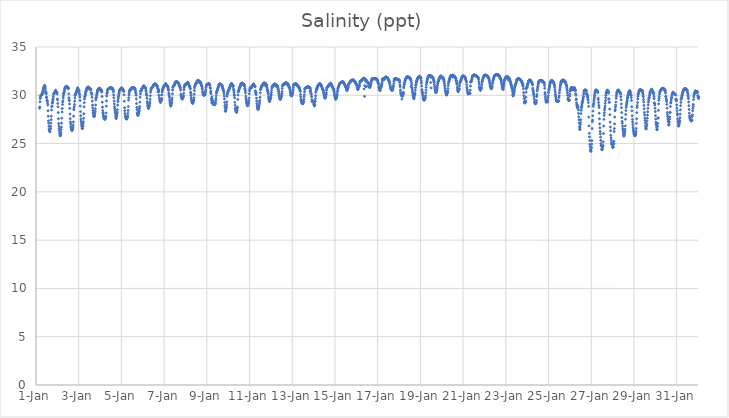
| Category | Salinity (ppt) |
|---|---|
| 44927.166666666664 | 28.66 |
| 44927.177083333336 | 28.79 |
| 44927.1875 | 29.33 |
| 44927.197916666664 | 29.66 |
| 44927.208333333336 | 29.82 |
| 44927.21875 | 29.91 |
| 44927.229166666664 | 30 |
| 44927.239583333336 | 30.04 |
| 44927.25 | 30.04 |
| 44927.260416666664 | 30.03 |
| 44927.270833333336 | 30.05 |
| 44927.28125 | 30.08 |
| 44927.291666666664 | 30.15 |
| 44927.302083333336 | 30.22 |
| 44927.3125 | 30.32 |
| 44927.322916666664 | 30.42 |
| 44927.333333333336 | 30.52 |
| 44927.34375 | 30.65 |
| 44927.354166666664 | 30.73 |
| 44927.364583333336 | 30.8 |
| 44927.375 | 30.87 |
| 44927.385416666664 | 30.89 |
| 44927.395833333336 | 30.99 |
| 44927.40625 | 31.03 |
| 44927.416666666664 | 30.91 |
| 44927.427083333336 | 30.85 |
| 44927.4375 | 30.65 |
| 44927.447916666664 | 30.25 |
| 44927.458333333336 | 30.4 |
| 44927.46875 | 30.28 |
| 44927.479166666664 | 30.15 |
| 44927.489583333336 | 29.82 |
| 44927.5 | 29.74 |
| 44927.510416666664 | 29.44 |
| 44927.520833333336 | 29.48 |
| 44927.53125 | 29.41 |
| 44927.541666666664 | 29.2 |
| 44927.552083333336 | 28.99 |
| 44927.5625 | 28.4 |
| 44927.572916666664 | 27.83 |
| 44927.583333333336 | 27.35 |
| 44927.59375 | 27.11 |
| 44927.604166666664 | 26.8 |
| 44927.614583333336 | 26.53 |
| 44927.625 | 26.37 |
| 44927.635416666664 | 26.31 |
| 44927.645833333336 | 26.23 |
| 44927.65625 | 26.25 |
| 44927.666666666664 | 26.49 |
| 44927.677083333336 | 26.56 |
| 44927.6875 | 26.77 |
| 44927.697916666664 | 27.11 |
| 44927.708333333336 | 27.47 |
| 44927.71875 | 27.84 |
| 44927.729166666664 | 28.48 |
| 44927.739583333336 | 28.84 |
| 44927.75 | 28.88 |
| 44927.760416666664 | 29.19 |
| 44927.770833333336 | 29.25 |
| 44927.78125 | 29.39 |
| 44927.791666666664 | 29.55 |
| 44927.802083333336 | 29.69 |
| 44927.8125 | 29.88 |
| 44927.822916666664 | 30.12 |
| 44927.833333333336 | 30.15 |
| 44927.84375 | 30.17 |
| 44927.854166666664 | 30.19 |
| 44927.864583333336 | 30.22 |
| 44927.875 | 30.25 |
| 44927.885416666664 | 30.34 |
| 44927.895833333336 | 30.44 |
| 44927.90625 | 30.43 |
| 44927.916666666664 | 30.53 |
| 44927.927083333336 | 30.34 |
| 44927.9375 | 30.28 |
| 44927.947916666664 | 30.37 |
| 44927.958333333336 | 30.36 |
| 44927.96875 | 30.26 |
| 44927.979166666664 | 30.27 |
| 44927.989583333336 | 30.14 |
| 44928.0 | 29.61 |
| 44928.010416666664 | 29.53 |
| 44928.020833333336 | 29.16 |
| 44928.03125 | 28.8 |
| 44928.041666666664 | 28.22 |
| 44928.052083333336 | 27.57 |
| 44928.0625 | 27.08 |
| 44928.072916666664 | 26.83 |
| 44928.083333333336 | 26.58 |
| 44928.09375 | 26.38 |
| 44928.104166666664 | 26.17 |
| 44928.114583333336 | 25.99 |
| 44928.125 | 25.87 |
| 44928.135416666664 | 25.81 |
| 44928.145833333336 | 25.83 |
| 44928.15625 | 25.96 |
| 44928.166666666664 | 26.14 |
| 44928.177083333336 | 26.45 |
| 44928.1875 | 26.71 |
| 44928.197916666664 | 27.12 |
| 44928.208333333336 | 27.63 |
| 44928.21875 | 28.27 |
| 44928.229166666664 | 28.62 |
| 44928.239583333336 | 29.05 |
| 44928.25 | 29.32 |
| 44928.260416666664 | 29.42 |
| 44928.270833333336 | 29.72 |
| 44928.28125 | 29.93 |
| 44928.291666666664 | 30.12 |
| 44928.302083333336 | 30.2 |
| 44928.3125 | 30.28 |
| 44928.322916666664 | 30.41 |
| 44928.333333333336 | 30.55 |
| 44928.34375 | 30.66 |
| 44928.354166666664 | 30.73 |
| 44928.364583333336 | 30.78 |
| 44928.375 | 30.83 |
| 44928.385416666664 | 30.87 |
| 44928.395833333336 | 30.89 |
| 44928.40625 | 30.9 |
| 44928.416666666664 | 30.91 |
| 44928.427083333336 | 30.92 |
| 44928.4375 | 30.92 |
| 44928.447916666664 | 30.81 |
| 44928.458333333336 | 30.88 |
| 44928.46875 | 30.84 |
| 44928.479166666664 | 30.79 |
| 44928.489583333336 | 30.81 |
| 44928.5 | 30.79 |
| 44928.510416666664 | 30.7 |
| 44928.520833333336 | 30.69 |
| 44928.53125 | 30.15 |
| 44928.541666666664 | 29.75 |
| 44928.552083333336 | 29.52 |
| 44928.5625 | 29.44 |
| 44928.572916666664 | 29.1 |
| 44928.583333333336 | 28.65 |
| 44928.59375 | 28.06 |
| 44928.604166666664 | 27.58 |
| 44928.614583333336 | 27.24 |
| 44928.625 | 27.04 |
| 44928.635416666664 | 26.79 |
| 44928.645833333336 | 26.65 |
| 44928.65625 | 26.53 |
| 44928.666666666664 | 26.44 |
| 44928.677083333336 | 26.35 |
| 44928.6875 | 26.36 |
| 44928.697916666664 | 26.43 |
| 44928.708333333336 | 26.51 |
| 44928.71875 | 26.58 |
| 44928.729166666664 | 26.68 |
| 44928.739583333336 | 26.92 |
| 44928.75 | 27.24 |
| 44928.760416666664 | 27.83 |
| 44928.770833333336 | 28.5 |
| 44928.78125 | 28.67 |
| 44928.791666666664 | 28.84 |
| 44928.802083333336 | 29.05 |
| 44928.8125 | 29.39 |
| 44928.822916666664 | 29.71 |
| 44928.833333333336 | 29.98 |
| 44928.84375 | 30.08 |
| 44928.854166666664 | 30.14 |
| 44928.864583333336 | 30.14 |
| 44928.875 | 30.23 |
| 44928.885416666664 | 30.31 |
| 44928.895833333336 | 30.38 |
| 44928.90625 | 30.43 |
| 44928.916666666664 | 30.48 |
| 44928.927083333336 | 30.59 |
| 44928.9375 | 30.66 |
| 44928.947916666664 | 30.78 |
| 44928.958333333336 | 30.68 |
| 44928.96875 | 30.62 |
| 44928.979166666664 | 30.59 |
| 44928.989583333336 | 30.54 |
| 44929.0 | 30.49 |
| 44929.010416666664 | 30.54 |
| 44929.020833333336 | 30.43 |
| 44929.03125 | 30.2 |
| 44929.041666666664 | 30.07 |
| 44929.052083333336 | 29.82 |
| 44929.0625 | 29.47 |
| 44929.072916666664 | 28.88 |
| 44929.083333333336 | 28.31 |
| 44929.09375 | 27.89 |
| 44929.104166666664 | 27.55 |
| 44929.114583333336 | 27.33 |
| 44929.125 | 27.14 |
| 44929.135416666664 | 26.92 |
| 44929.145833333336 | 26.79 |
| 44929.15625 | 26.62 |
| 44929.166666666664 | 26.55 |
| 44929.177083333336 | 26.57 |
| 44929.1875 | 26.76 |
| 44929.197916666664 | 26.9 |
| 44929.208333333336 | 27.08 |
| 44929.21875 | 27.27 |
| 44929.229166666664 | 27.61 |
| 44929.239583333336 | 28.09 |
| 44929.25 | 28.81 |
| 44929.260416666664 | 29.23 |
| 44929.270833333336 | 29.61 |
| 44929.28125 | 29.82 |
| 44929.291666666664 | 29.86 |
| 44929.302083333336 | 30 |
| 44929.3125 | 30.11 |
| 44929.322916666664 | 30.25 |
| 44929.333333333336 | 30.35 |
| 44929.34375 | 30.42 |
| 44929.354166666664 | 30.48 |
| 44929.364583333336 | 30.59 |
| 44929.375 | 30.67 |
| 44929.385416666664 | 30.73 |
| 44929.395833333336 | 30.78 |
| 44929.40625 | 30.8 |
| 44929.416666666664 | 30.82 |
| 44929.427083333336 | 30.83 |
| 44929.4375 | 30.84 |
| 44929.447916666664 | 30.84 |
| 44929.458333333336 | 30.84 |
| 44929.46875 | 30.74 |
| 44929.479166666664 | 30.75 |
| 44929.489583333336 | 30.74 |
| 44929.5 | 30.75 |
| 44929.510416666664 | 30.64 |
| 44929.520833333336 | 30.69 |
| 44929.53125 | 30.62 |
| 44929.541666666664 | 30.61 |
| 44929.552083333336 | 30.68 |
| 44929.5625 | 30.6 |
| 44929.572916666664 | 30.58 |
| 44929.583333333336 | 30.27 |
| 44929.59375 | 30.2 |
| 44929.604166666664 | 30.19 |
| 44929.614583333336 | 30.09 |
| 44929.625 | 29.79 |
| 44929.635416666664 | 29.4 |
| 44929.645833333336 | 28.99 |
| 44929.65625 | 28.71 |
| 44929.666666666664 | 28.43 |
| 44929.677083333336 | 28.21 |
| 44929.6875 | 28.09 |
| 44929.697916666664 | 27.93 |
| 44929.708333333336 | 27.82 |
| 44929.71875 | 27.77 |
| 44929.729166666664 | 27.82 |
| 44929.739583333336 | 27.95 |
| 44929.75 | 28.07 |
| 44929.760416666664 | 28.15 |
| 44929.770833333336 | 28.32 |
| 44929.78125 | 28.6 |
| 44929.791666666664 | 28.99 |
| 44929.802083333336 | 29.52 |
| 44929.8125 | 29.68 |
| 44929.822916666664 | 29.77 |
| 44929.833333333336 | 29.92 |
| 44929.84375 | 30.07 |
| 44929.854166666664 | 30.2 |
| 44929.864583333336 | 30.31 |
| 44929.875 | 30.4 |
| 44929.885416666664 | 30.49 |
| 44929.895833333336 | 30.57 |
| 44929.90625 | 30.62 |
| 44929.916666666664 | 30.65 |
| 44929.927083333336 | 30.68 |
| 44929.9375 | 30.69 |
| 44929.947916666664 | 30.7 |
| 44929.958333333336 | 30.71 |
| 44929.96875 | 30.72 |
| 44929.979166666664 | 30.73 |
| 44929.989583333336 | 30.72 |
| 44930.0 | 30.58 |
| 44930.010416666664 | 30.54 |
| 44930.020833333336 | 30.6 |
| 44930.03125 | 30.59 |
| 44930.041666666664 | 30.48 |
| 44930.052083333336 | 30.48 |
| 44930.0625 | 30.55 |
| 44930.072916666664 | 30.39 |
| 44930.083333333336 | 30.33 |
| 44930.09375 | 29.87 |
| 44930.104166666664 | 29.29 |
| 44930.114583333336 | 28.77 |
| 44930.125 | 28.42 |
| 44930.135416666664 | 28.21 |
| 44930.145833333336 | 28.07 |
| 44930.15625 | 27.9 |
| 44930.166666666664 | 27.77 |
| 44930.177083333336 | 27.67 |
| 44930.1875 | 27.59 |
| 44930.197916666664 | 27.53 |
| 44930.208333333336 | 27.52 |
| 44930.21875 | 27.53 |
| 44930.229166666664 | 27.54 |
| 44930.239583333336 | 27.56 |
| 44930.25 | 27.59 |
| 44930.260416666664 | 27.69 |
| 44930.270833333336 | 27.83 |
| 44930.28125 | 28.17 |
| 44930.291666666664 | 28.88 |
| 44930.302083333336 | 29.42 |
| 44930.3125 | 29.92 |
| 44930.322916666664 | 30.17 |
| 44930.333333333336 | 30.3 |
| 44930.34375 | 30.45 |
| 44930.354166666664 | 30.56 |
| 44930.364583333336 | 30.61 |
| 44930.375 | 30.64 |
| 44930.385416666664 | 30.66 |
| 44930.395833333336 | 30.66 |
| 44930.40625 | 30.68 |
| 44930.416666666664 | 30.69 |
| 44930.427083333336 | 30.7 |
| 44930.4375 | 30.72 |
| 44930.447916666664 | 30.75 |
| 44930.458333333336 | 30.77 |
| 44930.46875 | 30.78 |
| 44930.479166666664 | 30.8 |
| 44930.489583333336 | 30.8 |
| 44930.5 | 30.8 |
| 44930.510416666664 | 30.8 |
| 44930.520833333336 | 30.72 |
| 44930.53125 | 30.74 |
| 44930.541666666664 | 30.68 |
| 44930.552083333336 | 30.69 |
| 44930.5625 | 30.67 |
| 44930.572916666664 | 30.71 |
| 44930.583333333336 | 30.73 |
| 44930.59375 | 30.68 |
| 44930.604166666664 | 30.61 |
| 44930.614583333336 | 30.52 |
| 44930.625 | 30.35 |
| 44930.635416666664 | 30.04 |
| 44930.645833333336 | 29.75 |
| 44930.65625 | 29.4 |
| 44930.666666666664 | 29.1 |
| 44930.677083333336 | 28.81 |
| 44930.6875 | 28.63 |
| 44930.697916666664 | 28.45 |
| 44930.708333333336 | 28.28 |
| 44930.71875 | 28.12 |
| 44930.729166666664 | 27.9 |
| 44930.739583333336 | 27.72 |
| 44930.75 | 27.61 |
| 44930.760416666664 | 27.6 |
| 44930.770833333336 | 27.81 |
| 44930.78125 | 27.96 |
| 44930.791666666664 | 28.06 |
| 44930.802083333336 | 28.25 |
| 44930.8125 | 28.5 |
| 44930.822916666664 | 28.97 |
| 44930.833333333336 | 29.33 |
| 44930.84375 | 29.51 |
| 44930.854166666664 | 29.72 |
| 44930.864583333336 | 29.87 |
| 44930.875 | 30.03 |
| 44930.885416666664 | 30.18 |
| 44930.895833333336 | 30.32 |
| 44930.90625 | 30.44 |
| 44930.916666666664 | 30.53 |
| 44930.927083333336 | 30.56 |
| 44930.9375 | 30.61 |
| 44930.947916666664 | 30.63 |
| 44930.958333333336 | 30.66 |
| 44930.96875 | 30.7 |
| 44930.979166666664 | 30.72 |
| 44930.989583333336 | 30.73 |
| 44931.0 | 30.77 |
| 44931.010416666664 | 30.75 |
| 44931.020833333336 | 30.77 |
| 44931.03125 | 30.65 |
| 44931.041666666664 | 30.68 |
| 44931.052083333336 | 30.67 |
| 44931.0625 | 30.64 |
| 44931.072916666664 | 30.54 |
| 44931.083333333336 | 30.46 |
| 44931.09375 | 30.5 |
| 44931.104166666664 | 30.48 |
| 44931.114583333336 | 30.4 |
| 44931.125 | 30.05 |
| 44931.135416666664 | 29.38 |
| 44931.145833333336 | 28.72 |
| 44931.15625 | 28.4 |
| 44931.166666666664 | 28.12 |
| 44931.177083333336 | 27.94 |
| 44931.1875 | 27.79 |
| 44931.197916666664 | 27.71 |
| 44931.208333333336 | 27.65 |
| 44931.21875 | 27.59 |
| 44931.229166666664 | 27.57 |
| 44931.239583333336 | 27.54 |
| 44931.25 | 27.55 |
| 44931.260416666664 | 27.63 |
| 44931.270833333336 | 27.67 |
| 44931.28125 | 27.71 |
| 44931.291666666664 | 27.86 |
| 44931.302083333336 | 28.12 |
| 44931.3125 | 28.43 |
| 44931.322916666664 | 28.83 |
| 44931.333333333336 | 29.5 |
| 44931.34375 | 29.75 |
| 44931.354166666664 | 30.03 |
| 44931.364583333336 | 30.24 |
| 44931.375 | 30.4 |
| 44931.385416666664 | 30.48 |
| 44931.395833333336 | 30.53 |
| 44931.40625 | 30.56 |
| 44931.416666666664 | 30.58 |
| 44931.427083333336 | 30.59 |
| 44931.4375 | 30.6 |
| 44931.447916666664 | 30.63 |
| 44931.458333333336 | 30.68 |
| 44931.46875 | 30.72 |
| 44931.479166666664 | 30.74 |
| 44931.489583333336 | 30.76 |
| 44931.5 | 30.77 |
| 44931.510416666664 | 30.78 |
| 44931.520833333336 | 30.79 |
| 44931.53125 | 30.8 |
| 44931.541666666664 | 30.8 |
| 44931.552083333336 | 30.81 |
| 44931.5625 | 30.79 |
| 44931.572916666664 | 30.79 |
| 44931.583333333336 | 30.76 |
| 44931.59375 | 30.74 |
| 44931.604166666664 | 30.75 |
| 44931.614583333336 | 30.7 |
| 44931.625 | 30.71 |
| 44931.635416666664 | 30.67 |
| 44931.645833333336 | 30.57 |
| 44931.65625 | 30.49 |
| 44931.666666666664 | 30.31 |
| 44931.677083333336 | 30.16 |
| 44931.6875 | 30 |
| 44931.697916666664 | 29.62 |
| 44931.708333333336 | 29.14 |
| 44931.71875 | 28.75 |
| 44931.729166666664 | 28.52 |
| 44931.739583333336 | 28.2 |
| 44931.75 | 28.07 |
| 44931.760416666664 | 27.96 |
| 44931.770833333336 | 27.91 |
| 44931.78125 | 27.95 |
| 44931.791666666664 | 27.96 |
| 44931.802083333336 | 28.12 |
| 44931.8125 | 28.16 |
| 44931.822916666664 | 28.32 |
| 44931.833333333336 | 28.45 |
| 44931.84375 | 28.65 |
| 44931.854166666664 | 28.84 |
| 44931.864583333336 | 29.29 |
| 44931.875 | 29.8 |
| 44931.885416666664 | 30.15 |
| 44931.895833333336 | 30.41 |
| 44931.90625 | 30.45 |
| 44931.916666666664 | 30.4 |
| 44931.927083333336 | 30.51 |
| 44931.9375 | 30.57 |
| 44931.947916666664 | 30.63 |
| 44931.958333333336 | 30.67 |
| 44931.96875 | 30.69 |
| 44931.979166666664 | 30.73 |
| 44931.989583333336 | 30.77 |
| 44932.0 | 30.81 |
| 44932.010416666664 | 30.86 |
| 44932.020833333336 | 30.89 |
| 44932.03125 | 30.92 |
| 44932.041666666664 | 30.97 |
| 44932.052083333336 | 31 |
| 44932.0625 | 30.91 |
| 44932.072916666664 | 30.89 |
| 44932.083333333336 | 30.84 |
| 44932.09375 | 30.82 |
| 44932.104166666664 | 30.78 |
| 44932.114583333336 | 30.81 |
| 44932.125 | 30.78 |
| 44932.135416666664 | 30.68 |
| 44932.145833333336 | 30.52 |
| 44932.15625 | 30.4 |
| 44932.166666666664 | 30.2 |
| 44932.177083333336 | 30.05 |
| 44932.1875 | 29.97 |
| 44932.197916666664 | 29.69 |
| 44932.208333333336 | 29.34 |
| 44932.21875 | 29.17 |
| 44932.229166666664 | 28.98 |
| 44932.239583333336 | 28.83 |
| 44932.25 | 28.74 |
| 44932.260416666664 | 28.65 |
| 44932.270833333336 | 28.64 |
| 44932.28125 | 28.67 |
| 44932.291666666664 | 28.81 |
| 44932.302083333336 | 28.85 |
| 44932.3125 | 28.91 |
| 44932.322916666664 | 29.12 |
| 44932.333333333336 | 29.29 |
| 44932.34375 | 29.57 |
| 44932.354166666664 | 29.95 |
| 44932.364583333336 | 30.31 |
| 44932.375 | 30.49 |
| 44932.385416666664 | 30.64 |
| 44932.395833333336 | 30.72 |
| 44932.40625 | 30.75 |
| 44932.416666666664 | 30.76 |
| 44932.427083333336 | 30.75 |
| 44932.4375 | 30.78 |
| 44932.447916666664 | 30.82 |
| 44932.458333333336 | 30.87 |
| 44932.46875 | 30.9 |
| 44932.479166666664 | 30.93 |
| 44932.489583333336 | 30.98 |
| 44932.5 | 31.02 |
| 44932.510416666664 | 31.06 |
| 44932.520833333336 | 31.09 |
| 44932.53125 | 31.12 |
| 44932.541666666664 | 31.14 |
| 44932.552083333336 | 31.16 |
| 44932.5625 | 31.18 |
| 44932.572916666664 | 31.18 |
| 44932.583333333336 | 31.18 |
| 44932.59375 | 31.11 |
| 44932.604166666664 | 31.15 |
| 44932.614583333336 | 31.14 |
| 44932.625 | 31.11 |
| 44932.635416666664 | 31.06 |
| 44932.645833333336 | 31.04 |
| 44932.65625 | 31.01 |
| 44932.666666666664 | 30.99 |
| 44932.677083333336 | 30.93 |
| 44932.6875 | 30.81 |
| 44932.697916666664 | 30.72 |
| 44932.708333333336 | 30.34 |
| 44932.71875 | 30.66 |
| 44932.729166666664 | 30.59 |
| 44932.739583333336 | 30.52 |
| 44932.75 | 30.36 |
| 44932.760416666664 | 30 |
| 44932.770833333336 | 29.98 |
| 44932.78125 | 29.7 |
| 44932.791666666664 | 29.54 |
| 44932.802083333336 | 29.45 |
| 44932.8125 | 29.36 |
| 44932.822916666664 | 29.29 |
| 44932.833333333336 | 29.25 |
| 44932.84375 | 29.38 |
| 44932.854166666664 | 29.45 |
| 44932.864583333336 | 29.48 |
| 44932.875 | 29.57 |
| 44932.885416666664 | 29.69 |
| 44932.895833333336 | 30.05 |
| 44932.90625 | 30.34 |
| 44932.916666666664 | 30.46 |
| 44932.927083333336 | 30.57 |
| 44932.9375 | 30.64 |
| 44932.947916666664 | 30.72 |
| 44932.958333333336 | 30.79 |
| 44932.96875 | 30.84 |
| 44932.979166666664 | 30.88 |
| 44932.989583333336 | 30.93 |
| 44933.0 | 30.97 |
| 44933.010416666664 | 31.01 |
| 44933.020833333336 | 31.03 |
| 44933.03125 | 31.05 |
| 44933.041666666664 | 31.07 |
| 44933.052083333336 | 31.1 |
| 44933.0625 | 31.13 |
| 44933.072916666664 | 31.22 |
| 44933.083333333336 | 31.08 |
| 44933.09375 | 31.1 |
| 44933.104166666664 | 31.07 |
| 44933.114583333336 | 31.05 |
| 44933.125 | 31.03 |
| 44933.135416666664 | 30.99 |
| 44933.145833333336 | 30.97 |
| 44933.15625 | 30.91 |
| 44933.166666666664 | 30.91 |
| 44933.177083333336 | 30.82 |
| 44933.1875 | 30.72 |
| 44933.197916666664 | 30.54 |
| 44933.208333333336 | 30.55 |
| 44933.21875 | 30.24 |
| 44933.229166666664 | 30.09 |
| 44933.239583333336 | 29.91 |
| 44933.25 | 29.77 |
| 44933.260416666664 | 29.52 |
| 44933.270833333336 | 29.33 |
| 44933.28125 | 29.18 |
| 44933.291666666664 | 29.02 |
| 44933.302083333336 | 28.94 |
| 44933.3125 | 28.9 |
| 44933.322916666664 | 28.88 |
| 44933.333333333336 | 29.07 |
| 44933.34375 | 29.17 |
| 44933.354166666664 | 29.28 |
| 44933.364583333336 | 29.51 |
| 44933.375 | 29.72 |
| 44933.385416666664 | 30.15 |
| 44933.395833333336 | 30.54 |
| 44933.40625 | 30.79 |
| 44933.416666666664 | 30.9 |
| 44933.427083333336 | 30.95 |
| 44933.4375 | 30.96 |
| 44933.447916666664 | 30.98 |
| 44933.458333333336 | 30.98 |
| 44933.46875 | 31 |
| 44933.479166666664 | 31.06 |
| 44933.489583333336 | 31.17 |
| 44933.5 | 31.23 |
| 44933.510416666664 | 31.28 |
| 44933.520833333336 | 31.33 |
| 44933.53125 | 31.35 |
| 44933.541666666664 | 31.36 |
| 44933.552083333336 | 31.38 |
| 44933.5625 | 31.4 |
| 44933.572916666664 | 31.4 |
| 44933.583333333336 | 31.4 |
| 44933.59375 | 31.4 |
| 44933.604166666664 | 31.38 |
| 44933.614583333336 | 31.31 |
| 44933.625 | 31.37 |
| 44933.635416666664 | 31.33 |
| 44933.645833333336 | 31.29 |
| 44933.65625 | 31.28 |
| 44933.666666666664 | 31.26 |
| 44933.677083333336 | 31.24 |
| 44933.6875 | 31.19 |
| 44933.697916666664 | 31.14 |
| 44933.708333333336 | 31.03 |
| 44933.71875 | 30.97 |
| 44933.729166666664 | 30.95 |
| 44933.739583333336 | 30.88 |
| 44933.75 | 30.8 |
| 44933.760416666664 | 30.73 |
| 44933.770833333336 | 30.53 |
| 44933.78125 | 30.11 |
| 44933.791666666664 | 30.03 |
| 44933.802083333336 | 29.87 |
| 44933.8125 | 29.78 |
| 44933.822916666664 | 29.73 |
| 44933.833333333336 | 29.65 |
| 44933.84375 | 29.61 |
| 44933.854166666664 | 29.61 |
| 44933.864583333336 | 29.7 |
| 44933.875 | 29.76 |
| 44933.885416666664 | 29.78 |
| 44933.895833333336 | 29.84 |
| 44933.90625 | 29.95 |
| 44933.916666666664 | 30.21 |
| 44933.927083333336 | 30.57 |
| 44933.9375 | 30.78 |
| 44933.947916666664 | 30.92 |
| 44933.958333333336 | 30.99 |
| 44933.96875 | 31.03 |
| 44933.979166666664 | 31.07 |
| 44933.989583333336 | 31.09 |
| 44934.0 | 31.12 |
| 44934.010416666664 | 31.14 |
| 44934.020833333336 | 31.16 |
| 44934.03125 | 31.17 |
| 44934.041666666664 | 31.19 |
| 44934.052083333336 | 31.2 |
| 44934.0625 | 31.23 |
| 44934.072916666664 | 31.25 |
| 44934.083333333336 | 31.26 |
| 44934.09375 | 31.27 |
| 44934.104166666664 | 31.35 |
| 44934.114583333336 | 31.29 |
| 44934.125 | 31.27 |
| 44934.135416666664 | 31.21 |
| 44934.145833333336 | 31.18 |
| 44934.15625 | 31.13 |
| 44934.166666666664 | 31 |
| 44934.177083333336 | 30.97 |
| 44934.1875 | 30.94 |
| 44934.197916666664 | 30.89 |
| 44934.208333333336 | 30.84 |
| 44934.21875 | 30.74 |
| 44934.229166666664 | 30.67 |
| 44934.239583333336 | 30.32 |
| 44934.25 | 30.19 |
| 44934.260416666664 | 29.97 |
| 44934.270833333336 | 29.73 |
| 44934.28125 | 29.55 |
| 44934.291666666664 | 29.41 |
| 44934.302083333336 | 29.33 |
| 44934.3125 | 29.24 |
| 44934.322916666664 | 29.18 |
| 44934.333333333336 | 29.16 |
| 44934.34375 | 29.18 |
| 44934.354166666664 | 29.26 |
| 44934.364583333336 | 29.34 |
| 44934.375 | 29.4 |
| 44934.385416666664 | 29.54 |
| 44934.395833333336 | 29.75 |
| 44934.40625 | 30.11 |
| 44934.416666666664 | 30.49 |
| 44934.427083333336 | 30.77 |
| 44934.4375 | 30.92 |
| 44934.447916666664 | 31.04 |
| 44934.458333333336 | 31.09 |
| 44934.46875 | 31.13 |
| 44934.479166666664 | 31.17 |
| 44934.489583333336 | 31.19 |
| 44934.5 | 31.2 |
| 44934.510416666664 | 31.25 |
| 44934.520833333336 | 31.36 |
| 44934.53125 | 31.42 |
| 44934.541666666664 | 31.46 |
| 44934.552083333336 | 31.5 |
| 44934.5625 | 31.51 |
| 44934.572916666664 | 31.51 |
| 44934.583333333336 | 31.52 |
| 44934.59375 | 31.53 |
| 44934.604166666664 | 31.53 |
| 44934.614583333336 | 31.53 |
| 44934.625 | 31.36 |
| 44934.635416666664 | 31.45 |
| 44934.645833333336 | 31.43 |
| 44934.65625 | 31.39 |
| 44934.666666666664 | 31.38 |
| 44934.677083333336 | 31.4 |
| 44934.6875 | 31.33 |
| 44934.697916666664 | 31.37 |
| 44934.708333333336 | 31.28 |
| 44934.71875 | 31.22 |
| 44934.729166666664 | 31.16 |
| 44934.739583333336 | 31.13 |
| 44934.75 | 31.03 |
| 44934.760416666664 | 30.96 |
| 44934.770833333336 | 30.89 |
| 44934.78125 | 30.73 |
| 44934.791666666664 | 30.61 |
| 44934.802083333336 | 30.38 |
| 44934.8125 | 30.29 |
| 44934.822916666664 | 30.18 |
| 44934.833333333336 | 30.1 |
| 44934.84375 | 30.06 |
| 44934.854166666664 | 30.03 |
| 44934.864583333336 | 30 |
| 44934.875 | 29.99 |
| 44934.885416666664 | 30.04 |
| 44934.895833333336 | 30.09 |
| 44934.90625 | 30.07 |
| 44934.916666666664 | 30.12 |
| 44934.927083333336 | 30.26 |
| 44934.9375 | 30.38 |
| 44934.947916666664 | 30.55 |
| 44934.958333333336 | 30.8 |
| 44934.96875 | 30.95 |
| 44934.979166666664 | 31.04 |
| 44934.989583333336 | 31.11 |
| 44935.0 | 31.12 |
| 44935.010416666664 | 31.12 |
| 44935.020833333336 | 31.11 |
| 44935.03125 | 31.11 |
| 44935.041666666664 | 31.15 |
| 44935.052083333336 | 31.16 |
| 44935.0625 | 31.15 |
| 44935.072916666664 | 31.17 |
| 44935.083333333336 | 31.18 |
| 44935.09375 | 31.19 |
| 44935.104166666664 | 31.22 |
| 44935.114583333336 | 31.11 |
| 44935.125 | 31.12 |
| 44935.135416666664 | 31.09 |
| 44935.145833333336 | 31.04 |
| 44935.15625 | 30.79 |
| 44935.166666666664 | 30.72 |
| 44935.177083333336 | 30.31 |
| 44935.1875 | 30.45 |
| 44935.197916666664 | 30.16 |
| 44935.208333333336 | 29.65 |
| 44935.21875 | 29.47 |
| 44935.229166666664 | 29.22 |
| 44935.239583333336 | 29.84 |
| 44935.25 | 29.62 |
| 44935.260416666664 | 29.42 |
| 44935.270833333336 | 29.45 |
| 44935.28125 | 29.3 |
| 44935.291666666664 | 29.16 |
| 44935.302083333336 | 29.06 |
| 44935.3125 | 29.04 |
| 44935.322916666664 | 29.05 |
| 44935.333333333336 | 29.06 |
| 44935.34375 | 29.06 |
| 44935.354166666664 | 29.05 |
| 44935.364583333336 | 29.01 |
| 44935.375 | 29.05 |
| 44935.385416666664 | 29.09 |
| 44935.395833333336 | 29.15 |
| 44935.40625 | 29.28 |
| 44935.416666666664 | 29.47 |
| 44935.427083333336 | 29.66 |
| 44935.4375 | 29.95 |
| 44935.447916666664 | 30.2 |
| 44935.458333333336 | 30.33 |
| 44935.46875 | 30.4 |
| 44935.479166666664 | 30.48 |
| 44935.489583333336 | 30.53 |
| 44935.5 | 30.58 |
| 44935.510416666664 | 30.66 |
| 44935.520833333336 | 30.75 |
| 44935.53125 | 30.83 |
| 44935.541666666664 | 30.9 |
| 44935.552083333336 | 30.98 |
| 44935.5625 | 31.05 |
| 44935.572916666664 | 31.11 |
| 44935.583333333336 | 31.13 |
| 44935.59375 | 31.15 |
| 44935.604166666664 | 31.16 |
| 44935.614583333336 | 31.18 |
| 44935.625 | 31.18 |
| 44935.635416666664 | 31.11 |
| 44935.645833333336 | 31.1 |
| 44935.65625 | 31.13 |
| 44935.666666666664 | 31.12 |
| 44935.677083333336 | 31.1 |
| 44935.6875 | 31.09 |
| 44935.697916666664 | 31.06 |
| 44935.708333333336 | 31.02 |
| 44935.71875 | 30.98 |
| 44935.729166666664 | 30.89 |
| 44935.739583333336 | 30.78 |
| 44935.75 | 30.71 |
| 44935.760416666664 | 30.62 |
| 44935.770833333336 | 30.52 |
| 44935.78125 | 30.48 |
| 44935.791666666664 | 30.37 |
| 44935.802083333336 | 30.17 |
| 44935.8125 | 29.91 |
| 44935.822916666664 | 29.63 |
| 44935.833333333336 | 29.26 |
| 44935.84375 | 28.94 |
| 44935.854166666664 | 28.7 |
| 44935.864583333336 | 28.43 |
| 44935.875 | 28.33 |
| 44935.885416666664 | 28.38 |
| 44935.895833333336 | 28.51 |
| 44935.90625 | 28.68 |
| 44935.916666666664 | 28.8 |
| 44935.927083333336 | 29.05 |
| 44935.9375 | 29.32 |
| 44935.947916666664 | 29.9 |
| 44935.958333333336 | 30.11 |
| 44935.96875 | 30.2 |
| 44935.979166666664 | 30.31 |
| 44935.989583333336 | 30.38 |
| 44936.0 | 30.43 |
| 44936.010416666664 | 30.48 |
| 44936.020833333336 | 30.54 |
| 44936.03125 | 30.59 |
| 44936.041666666664 | 30.62 |
| 44936.052083333336 | 30.68 |
| 44936.0625 | 30.75 |
| 44936.072916666664 | 30.83 |
| 44936.083333333336 | 30.9 |
| 44936.09375 | 30.96 |
| 44936.104166666664 | 31 |
| 44936.114583333336 | 31.06 |
| 44936.125 | 31.09 |
| 44936.135416666664 | 31.15 |
| 44936.145833333336 | 31.21 |
| 44936.15625 | 31.23 |
| 44936.166666666664 | 31.19 |
| 44936.177083333336 | 31.1 |
| 44936.1875 | 31.09 |
| 44936.197916666664 | 31 |
| 44936.208333333336 | 30.91 |
| 44936.21875 | 31.01 |
| 44936.229166666664 | 30.97 |
| 44936.239583333336 | 30.93 |
| 44936.25 | 30.64 |
| 44936.260416666664 | 30.5 |
| 44936.270833333336 | 30.3 |
| 44936.28125 | 30.08 |
| 44936.291666666664 | 29.96 |
| 44936.302083333336 | 29.73 |
| 44936.3125 | 29.27 |
| 44936.322916666664 | 28.96 |
| 44936.333333333336 | 28.65 |
| 44936.34375 | 28.51 |
| 44936.354166666664 | 28.44 |
| 44936.364583333336 | 28.35 |
| 44936.375 | 28.32 |
| 44936.385416666664 | 28.35 |
| 44936.395833333336 | 28.21 |
| 44936.40625 | 28.48 |
| 44936.416666666664 | 28.45 |
| 44936.427083333336 | 28.77 |
| 44936.4375 | 28.71 |
| 44936.447916666664 | 29.57 |
| 44936.458333333336 | 30.02 |
| 44936.46875 | 30.33 |
| 44936.479166666664 | 30.42 |
| 44936.489583333336 | 30.46 |
| 44936.5 | 30.54 |
| 44936.510416666664 | 30.63 |
| 44936.520833333336 | 30.7 |
| 44936.53125 | 30.78 |
| 44936.541666666664 | 30.84 |
| 44936.552083333336 | 30.9 |
| 44936.5625 | 30.92 |
| 44936.572916666664 | 30.97 |
| 44936.583333333336 | 31.09 |
| 44936.59375 | 31.16 |
| 44936.604166666664 | 31.19 |
| 44936.614583333336 | 31.22 |
| 44936.625 | 31.21 |
| 44936.635416666664 | 31.25 |
| 44936.645833333336 | 31.25 |
| 44936.65625 | 31.25 |
| 44936.666666666664 | 31.26 |
| 44936.677083333336 | 31.18 |
| 44936.6875 | 31.18 |
| 44936.697916666664 | 31.11 |
| 44936.708333333336 | 31.13 |
| 44936.71875 | 31.15 |
| 44936.729166666664 | 31.14 |
| 44936.739583333336 | 31.13 |
| 44936.75 | 31.1 |
| 44936.760416666664 | 31.02 |
| 44936.770833333336 | 30.92 |
| 44936.78125 | 30.72 |
| 44936.791666666664 | 30.58 |
| 44936.802083333336 | 30.46 |
| 44936.8125 | 30.26 |
| 44936.822916666664 | 29.91 |
| 44936.833333333336 | 29.7 |
| 44936.84375 | 29.54 |
| 44936.854166666664 | 29.37 |
| 44936.864583333336 | 29.21 |
| 44936.875 | 29.12 |
| 44936.885416666664 | 29.01 |
| 44936.895833333336 | 28.93 |
| 44936.90625 | 28.91 |
| 44936.916666666664 | 28.95 |
| 44936.927083333336 | 29.07 |
| 44936.9375 | 29.11 |
| 44936.947916666664 | 29.17 |
| 44936.958333333336 | 29.31 |
| 44936.96875 | 29.45 |
| 44936.979166666664 | 29.71 |
| 44936.989583333336 | 30.16 |
| 44937.0 | 30.45 |
| 44937.010416666664 | 30.64 |
| 44937.020833333336 | 30.72 |
| 44937.03125 | 30.77 |
| 44937.041666666664 | 30.81 |
| 44937.052083333336 | 30.81 |
| 44937.0625 | 30.79 |
| 44937.072916666664 | 30.79 |
| 44937.083333333336 | 30.76 |
| 44937.09375 | 30.82 |
| 44937.104166666664 | 30.89 |
| 44937.114583333336 | 30.94 |
| 44937.125 | 30.98 |
| 44937.135416666664 | 31.01 |
| 44937.145833333336 | 31.04 |
| 44937.15625 | 31.06 |
| 44937.166666666664 | 31.07 |
| 44937.177083333336 | 31.12 |
| 44937.1875 | 31.19 |
| 44937.197916666664 | 31.07 |
| 44937.208333333336 | 31.07 |
| 44937.21875 | 31 |
| 44937.229166666664 | 31 |
| 44937.239583333336 | 30.96 |
| 44937.25 | 30.93 |
| 44937.260416666664 | 30.89 |
| 44937.270833333336 | 30.46 |
| 44937.28125 | 30.36 |
| 44937.291666666664 | 30.13 |
| 44937.302083333336 | 30.28 |
| 44937.3125 | 30.09 |
| 44937.322916666664 | 29.7 |
| 44937.333333333336 | 29.41 |
| 44937.34375 | 29.13 |
| 44937.354166666664 | 28.91 |
| 44937.364583333336 | 28.77 |
| 44937.375 | 28.68 |
| 44937.385416666664 | 28.58 |
| 44937.395833333336 | 28.55 |
| 44937.40625 | 28.59 |
| 44937.416666666664 | 28.58 |
| 44937.427083333336 | 28.79 |
| 44937.4375 | 28.8 |
| 44937.447916666664 | 28.96 |
| 44937.458333333336 | 29.11 |
| 44937.46875 | 29.3 |
| 44937.479166666664 | 29.46 |
| 44937.489583333336 | 29.79 |
| 44937.5 | 30.25 |
| 44937.510416666664 | 30.58 |
| 44937.520833333336 | 30.61 |
| 44937.53125 | 30.69 |
| 44937.541666666664 | 30.79 |
| 44937.552083333336 | 30.86 |
| 44937.5625 | 30.93 |
| 44937.572916666664 | 30.96 |
| 44937.583333333336 | 30.98 |
| 44937.59375 | 30.99 |
| 44937.604166666664 | 31.04 |
| 44937.614583333336 | 31.08 |
| 44937.625 | 31.12 |
| 44937.635416666664 | 31.16 |
| 44937.645833333336 | 31.2 |
| 44937.65625 | 31.24 |
| 44937.666666666664 | 31.24 |
| 44937.677083333336 | 31.24 |
| 44937.6875 | 31.28 |
| 44937.697916666664 | 31.3 |
| 44937.708333333336 | 31.18 |
| 44937.71875 | 31.15 |
| 44937.729166666664 | 31.02 |
| 44937.739583333336 | 31.17 |
| 44937.75 | 31.23 |
| 44937.760416666664 | 31.19 |
| 44937.770833333336 | 31.06 |
| 44937.78125 | 31.12 |
| 44937.791666666664 | 31.06 |
| 44937.802083333336 | 31 |
| 44937.8125 | 30.82 |
| 44937.822916666664 | 30.75 |
| 44937.833333333336 | 30.59 |
| 44937.84375 | 30.54 |
| 44937.854166666664 | 30.41 |
| 44937.864583333336 | 30.34 |
| 44937.875 | 30.16 |
| 44937.885416666664 | 29.88 |
| 44937.895833333336 | 29.7 |
| 44937.90625 | 29.59 |
| 44937.916666666664 | 29.48 |
| 44937.927083333336 | 29.37 |
| 44937.9375 | 29.36 |
| 44937.947916666664 | 29.4 |
| 44937.958333333336 | 29.53 |
| 44937.96875 | 29.61 |
| 44937.979166666664 | 29.65 |
| 44937.989583333336 | 29.78 |
| 44938.0 | 29.94 |
| 44938.010416666664 | 30.09 |
| 44938.020833333336 | 30.27 |
| 44938.03125 | 30.5 |
| 44938.041666666664 | 30.74 |
| 44938.052083333336 | 30.89 |
| 44938.0625 | 30.9 |
| 44938.072916666664 | 30.85 |
| 44938.083333333336 | 30.91 |
| 44938.09375 | 30.98 |
| 44938.104166666664 | 31.03 |
| 44938.114583333336 | 31.08 |
| 44938.125 | 31.09 |
| 44938.135416666664 | 31.13 |
| 44938.145833333336 | 31.13 |
| 44938.15625 | 31.14 |
| 44938.166666666664 | 31.16 |
| 44938.177083333336 | 31.16 |
| 44938.1875 | 31.17 |
| 44938.197916666664 | 31.14 |
| 44938.208333333336 | 31.06 |
| 44938.21875 | 30.95 |
| 44938.229166666664 | 31.1 |
| 44938.239583333336 | 31.03 |
| 44938.25 | 30.98 |
| 44938.260416666664 | 31.08 |
| 44938.270833333336 | 31.06 |
| 44938.28125 | 31.04 |
| 44938.291666666664 | 31.02 |
| 44938.302083333336 | 30.95 |
| 44938.3125 | 30.9 |
| 44938.322916666664 | 30.82 |
| 44938.333333333336 | 30.68 |
| 44938.34375 | 30.63 |
| 44938.354166666664 | 30.48 |
| 44938.364583333336 | 30.34 |
| 44938.375 | 30.18 |
| 44938.385416666664 | 30.02 |
| 44938.395833333336 | 29.91 |
| 44938.40625 | 29.78 |
| 44938.416666666664 | 29.68 |
| 44938.427083333336 | 29.6 |
| 44938.4375 | 29.58 |
| 44938.447916666664 | 29.6 |
| 44938.458333333336 | 29.62 |
| 44938.46875 | 29.72 |
| 44938.479166666664 | 29.79 |
| 44938.489583333336 | 29.85 |
| 44938.5 | 30 |
| 44938.510416666664 | 30.18 |
| 44938.520833333336 | 30.39 |
| 44938.53125 | 30.71 |
| 44938.541666666664 | 30.94 |
| 44938.552083333336 | 31.06 |
| 44938.5625 | 31.13 |
| 44938.572916666664 | 31.14 |
| 44938.583333333336 | 31.14 |
| 44938.59375 | 31.15 |
| 44938.604166666664 | 31.14 |
| 44938.614583333336 | 31.13 |
| 44938.625 | 31.12 |
| 44938.635416666664 | 31.13 |
| 44938.645833333336 | 31.15 |
| 44938.65625 | 31.18 |
| 44938.666666666664 | 31.22 |
| 44938.677083333336 | 31.26 |
| 44938.6875 | 31.31 |
| 44938.697916666664 | 31.32 |
| 44938.708333333336 | 31.32 |
| 44938.71875 | 31.28 |
| 44938.729166666664 | 31.24 |
| 44938.739583333336 | 31.16 |
| 44938.75 | 31.28 |
| 44938.760416666664 | 31.2 |
| 44938.770833333336 | 31.16 |
| 44938.78125 | 31.11 |
| 44938.791666666664 | 31.22 |
| 44938.802083333336 | 31.13 |
| 44938.8125 | 31.06 |
| 44938.822916666664 | 31.06 |
| 44938.833333333336 | 30.91 |
| 44938.84375 | 30.88 |
| 44938.854166666664 | 30.87 |
| 44938.864583333336 | 30.83 |
| 44938.875 | 30.78 |
| 44938.885416666664 | 30.66 |
| 44938.895833333336 | 30.56 |
| 44938.90625 | 30.39 |
| 44938.916666666664 | 30.26 |
| 44938.927083333336 | 30.12 |
| 44938.9375 | 30 |
| 44938.947916666664 | 29.97 |
| 44938.958333333336 | 29.95 |
| 44938.96875 | 29.96 |
| 44938.979166666664 | 30 |
| 44938.989583333336 | 30.08 |
| 44939.0 | 30.12 |
| 44939.010416666664 | 30.18 |
| 44939.020833333336 | 30.3 |
| 44939.03125 | 30.46 |
| 44939.041666666664 | 30.63 |
| 44939.052083333336 | 30.85 |
| 44939.0625 | 31.05 |
| 44939.072916666664 | 31.14 |
| 44939.083333333336 | 31.14 |
| 44939.09375 | 31.17 |
| 44939.104166666664 | 31.15 |
| 44939.114583333336 | 31.14 |
| 44939.125 | 31.13 |
| 44939.135416666664 | 31.14 |
| 44939.145833333336 | 31.15 |
| 44939.15625 | 31.17 |
| 44939.166666666664 | 31.18 |
| 44939.177083333336 | 31.17 |
| 44939.1875 | 31.16 |
| 44939.197916666664 | 31.15 |
| 44939.208333333336 | 31.06 |
| 44939.21875 | 31 |
| 44939.229166666664 | 31.07 |
| 44939.239583333336 | 31.05 |
| 44939.25 | 30.96 |
| 44939.260416666664 | 31.03 |
| 44939.270833333336 | 30.95 |
| 44939.28125 | 30.89 |
| 44939.291666666664 | 30.8 |
| 44939.302083333336 | 30.85 |
| 44939.3125 | 30.84 |
| 44939.322916666664 | 30.84 |
| 44939.333333333336 | 30.74 |
| 44939.34375 | 30.61 |
| 44939.354166666664 | 30.6 |
| 44939.364583333336 | 30.49 |
| 44939.375 | 30.4 |
| 44939.385416666664 | 30.08 |
| 44939.395833333336 | 29.85 |
| 44939.40625 | 29.58 |
| 44939.416666666664 | 29.47 |
| 44939.427083333336 | 29.37 |
| 44939.4375 | 29.31 |
| 44939.447916666664 | 29.27 |
| 44939.458333333336 | 29.2 |
| 44939.46875 | 29.16 |
| 44939.479166666664 | 29.15 |
| 44939.489583333336 | 29.14 |
| 44939.5 | 29.12 |
| 44939.510416666664 | 29.22 |
| 44939.520833333336 | 29.28 |
| 44939.53125 | 29.37 |
| 44939.541666666664 | 29.56 |
| 44939.552083333336 | 29.82 |
| 44939.5625 | 30.05 |
| 44939.572916666664 | 30.35 |
| 44939.583333333336 | 30.6 |
| 44939.59375 | 30.69 |
| 44939.604166666664 | 30.7 |
| 44939.614583333336 | 30.74 |
| 44939.625 | 30.78 |
| 44939.635416666664 | 30.8 |
| 44939.645833333336 | 30.82 |
| 44939.65625 | 30.81 |
| 44939.666666666664 | 30.8 |
| 44939.677083333336 | 30.8 |
| 44939.6875 | 30.87 |
| 44939.697916666664 | 30.85 |
| 44939.708333333336 | 30.86 |
| 44939.71875 | 30.83 |
| 44939.729166666664 | 30.84 |
| 44939.739583333336 | 30.87 |
| 44939.75 | 30.86 |
| 44939.760416666664 | 30.86 |
| 44939.770833333336 | 30.87 |
| 44939.78125 | 30.84 |
| 44939.791666666664 | 30.85 |
| 44939.802083333336 | 30.82 |
| 44939.8125 | 30.8 |
| 44939.822916666664 | 30.75 |
| 44939.833333333336 | 30.4 |
| 44939.84375 | 30.73 |
| 44939.854166666664 | 30.54 |
| 44939.864583333336 | 30.44 |
| 44939.875 | 30.17 |
| 44939.885416666664 | 30.15 |
| 44939.895833333336 | 30.08 |
| 44939.90625 | 29.84 |
| 44939.916666666664 | 29.55 |
| 44939.927083333336 | 29.36 |
| 44939.9375 | 29.33 |
| 44939.947916666664 | 29.38 |
| 44939.958333333336 | 29.38 |
| 44939.96875 | 29.39 |
| 44939.979166666664 | 29.4 |
| 44939.989583333336 | 29.28 |
| 44940.0 | 29.24 |
| 44940.010416666664 | 29.06 |
| 44940.020833333336 | 28.99 |
| 44940.03125 | 28.96 |
| 44940.041666666664 | 28.89 |
| 44940.052083333336 | 29.06 |
| 44940.0625 | 29.33 |
| 44940.072916666664 | 29.42 |
| 44940.083333333336 | 29.65 |
| 44940.09375 | 29.95 |
| 44940.104166666664 | 30.3 |
| 44940.114583333336 | 30.45 |
| 44940.125 | 30.53 |
| 44940.135416666664 | 30.61 |
| 44940.145833333336 | 30.72 |
| 44940.15625 | 30.78 |
| 44940.166666666664 | 30.69 |
| 44940.177083333336 | 30.85 |
| 44940.1875 | 30.94 |
| 44940.197916666664 | 30.96 |
| 44940.208333333336 | 30.98 |
| 44940.21875 | 31.02 |
| 44940.229166666664 | 31.07 |
| 44940.239583333336 | 31.12 |
| 44940.25 | 31.15 |
| 44940.260416666664 | 31.17 |
| 44940.270833333336 | 31.15 |
| 44940.28125 | 31.21 |
| 44940.291666666664 | 31.17 |
| 44940.302083333336 | 31.18 |
| 44940.3125 | 31.16 |
| 44940.322916666664 | 31.15 |
| 44940.333333333336 | 31.1 |
| 44940.34375 | 31.07 |
| 44940.354166666664 | 31.02 |
| 44940.364583333336 | 30.95 |
| 44940.375 | 30.93 |
| 44940.385416666664 | 30.86 |
| 44940.395833333336 | 30.78 |
| 44940.40625 | 30.65 |
| 44940.416666666664 | 30.63 |
| 44940.427083333336 | 30.59 |
| 44940.4375 | 30.57 |
| 44940.447916666664 | 30.54 |
| 44940.458333333336 | 30.44 |
| 44940.46875 | 30.25 |
| 44940.479166666664 | 30.19 |
| 44940.489583333336 | 30.06 |
| 44940.5 | 29.92 |
| 44940.510416666664 | 29.83 |
| 44940.520833333336 | 29.72 |
| 44940.53125 | 29.7 |
| 44940.541666666664 | 29.73 |
| 44940.552083333336 | 29.84 |
| 44940.5625 | 29.9 |
| 44940.572916666664 | 29.94 |
| 44940.583333333336 | 30.07 |
| 44940.59375 | 30.24 |
| 44940.604166666664 | 30.51 |
| 44940.614583333336 | 30.69 |
| 44940.625 | 30.79 |
| 44940.635416666664 | 30.84 |
| 44940.645833333336 | 30.85 |
| 44940.65625 | 30.87 |
| 44940.666666666664 | 30.9 |
| 44940.677083333336 | 30.95 |
| 44940.6875 | 30.98 |
| 44940.697916666664 | 31 |
| 44940.708333333336 | 31.02 |
| 44940.71875 | 31.05 |
| 44940.729166666664 | 31.07 |
| 44940.739583333336 | 31.1 |
| 44940.75 | 31.13 |
| 44940.760416666664 | 31.17 |
| 44940.770833333336 | 31.11 |
| 44940.78125 | 31.19 |
| 44940.791666666664 | 31.25 |
| 44940.802083333336 | 31.18 |
| 44940.8125 | 31.18 |
| 44940.822916666664 | 31.14 |
| 44940.833333333336 | 31.11 |
| 44940.84375 | 31.04 |
| 44940.854166666664 | 30.98 |
| 44940.864583333336 | 30.94 |
| 44940.875 | 30.92 |
| 44940.885416666664 | 30.83 |
| 44940.895833333336 | 30.81 |
| 44940.90625 | 30.74 |
| 44940.916666666664 | 30.67 |
| 44940.927083333336 | 30.62 |
| 44940.9375 | 30.61 |
| 44940.947916666664 | 30.55 |
| 44940.958333333336 | 30.38 |
| 44940.96875 | 30.24 |
| 44940.979166666664 | 30.08 |
| 44940.989583333336 | 30 |
| 44941.0 | 29.88 |
| 44941.010416666664 | 29.77 |
| 44941.020833333336 | 29.69 |
| 44941.03125 | 29.59 |
| 44941.041666666664 | 29.61 |
| 44941.052083333336 | 29.63 |
| 44941.0625 | 29.74 |
| 44941.072916666664 | 29.8 |
| 44941.083333333336 | 29.82 |
| 44941.09375 | 29.95 |
| 44941.104166666664 | 30.09 |
| 44941.114583333336 | 30.34 |
| 44941.125 | 30.52 |
| 44941.135416666664 | 30.67 |
| 44941.145833333336 | 30.75 |
| 44941.15625 | 30.84 |
| 44941.166666666664 | 30.88 |
| 44941.177083333336 | 30.95 |
| 44941.1875 | 31.02 |
| 44941.197916666664 | 31.09 |
| 44941.208333333336 | 31.15 |
| 44941.21875 | 31.18 |
| 44941.229166666664 | 31.22 |
| 44941.239583333336 | 31.26 |
| 44941.25 | 31.28 |
| 44941.260416666664 | 31.28 |
| 44941.270833333336 | 31.29 |
| 44941.28125 | 31.31 |
| 44941.291666666664 | 31.34 |
| 44941.302083333336 | 31.35 |
| 44941.3125 | 31.36 |
| 44941.322916666664 | 31.34 |
| 44941.333333333336 | 31.4 |
| 44941.34375 | 31.38 |
| 44941.354166666664 | 31.41 |
| 44941.364583333336 | 31.4 |
| 44941.375 | 31.39 |
| 44941.385416666664 | 31.37 |
| 44941.395833333336 | 31.34 |
| 44941.40625 | 31.32 |
| 44941.416666666664 | 31.26 |
| 44941.427083333336 | 31.2 |
| 44941.4375 | 31.2 |
| 44941.447916666664 | 31.16 |
| 44941.458333333336 | 31.12 |
| 44941.46875 | 31.02 |
| 44941.479166666664 | 31 |
| 44941.489583333336 | 30.91 |
| 44941.5 | 30.87 |
| 44941.510416666664 | 30.85 |
| 44941.520833333336 | 30.87 |
| 44941.53125 | 30.71 |
| 44941.541666666664 | 30.58 |
| 44941.552083333336 | 30.52 |
| 44941.5625 | 30.48 |
| 44941.572916666664 | 30.64 |
| 44941.583333333336 | 30.67 |
| 44941.59375 | 30.69 |
| 44941.604166666664 | 30.75 |
| 44941.614583333336 | 30.81 |
| 44941.625 | 30.97 |
| 44941.635416666664 | 31.09 |
| 44941.645833333336 | 31.16 |
| 44941.65625 | 31.22 |
| 44941.666666666664 | 31.23 |
| 44941.677083333336 | 31.26 |
| 44941.6875 | 31.3 |
| 44941.697916666664 | 31.33 |
| 44941.708333333336 | 31.38 |
| 44941.71875 | 31.41 |
| 44941.729166666664 | 31.43 |
| 44941.739583333336 | 31.46 |
| 44941.75 | 31.49 |
| 44941.760416666664 | 31.51 |
| 44941.770833333336 | 31.53 |
| 44941.78125 | 31.55 |
| 44941.791666666664 | 31.56 |
| 44941.802083333336 | 31.58 |
| 44941.8125 | 31.58 |
| 44941.822916666664 | 31.57 |
| 44941.833333333336 | 31.54 |
| 44941.84375 | 31.55 |
| 44941.854166666664 | 31.58 |
| 44941.864583333336 | 31.57 |
| 44941.875 | 31.55 |
| 44941.885416666664 | 31.53 |
| 44941.895833333336 | 31.51 |
| 44941.90625 | 31.46 |
| 44941.916666666664 | 31.43 |
| 44941.927083333336 | 31.42 |
| 44941.9375 | 31.4 |
| 44941.947916666664 | 31.36 |
| 44941.958333333336 | 31.29 |
| 44941.96875 | 31.25 |
| 44941.979166666664 | 31.22 |
| 44941.989583333336 | 31.16 |
| 44942.0 | 31.11 |
| 44942.010416666664 | 31.1 |
| 44942.020833333336 | 31.05 |
| 44942.03125 | 31 |
| 44942.041666666664 | 30.8 |
| 44942.052083333336 | 30.68 |
| 44942.0625 | 30.61 |
| 44942.072916666664 | 30.61 |
| 44942.083333333336 | 30.64 |
| 44942.09375 | 30.76 |
| 44942.104166666664 | 30.81 |
| 44942.114583333336 | 30.84 |
| 44942.125 | 30.89 |
| 44942.135416666664 | 30.95 |
| 44942.145833333336 | 31.04 |
| 44942.15625 | 31.22 |
| 44942.166666666664 | 31.37 |
| 44942.177083333336 | 31.43 |
| 44942.1875 | 31.46 |
| 44942.197916666664 | 31.47 |
| 44942.208333333336 | 31.48 |
| 44942.21875 | 31.49 |
| 44942.229166666664 | 31.49 |
| 44942.239583333336 | 31.52 |
| 44942.25 | 31.53 |
| 44942.260416666664 | 31.55 |
| 44942.270833333336 | 31.58 |
| 44942.28125 | 31.61 |
| 44942.291666666664 | 31.64 |
| 44942.302083333336 | 31.67 |
| 44942.3125 | 31.69 |
| 44942.322916666664 | 31.71 |
| 44942.333333333336 | 31.73 |
| 44942.34375 | 31.76 |
| 44942.354166666664 | 31.78 |
| 44942.364583333336 | 30.66 |
| 44942.375 | 31.75 |
| 44942.385416666664 | 29.89 |
| 44942.395833333336 | 31 |
| 44942.40625 | 31.65 |
| 44942.416666666664 | 31.68 |
| 44942.427083333336 | 31.63 |
| 44942.4375 | 31.61 |
| 44942.447916666664 | 31.41 |
| 44942.458333333336 | 30.88 |
| 44942.46875 | 30.92 |
| 44942.479166666664 | 31.54 |
| 44942.489583333336 | 31.47 |
| 44942.5 | 31.42 |
| 44942.510416666664 | 31.4 |
| 44942.520833333336 | 31.31 |
| 44942.53125 | 31.34 |
| 44942.541666666664 | 31.3 |
| 44942.552083333336 | 31.32 |
| 44942.5625 | 31.3 |
| 44942.572916666664 | 31.19 |
| 44942.583333333336 | 31.05 |
| 44942.59375 | 30.96 |
| 44942.604166666664 | 30.92 |
| 44942.614583333336 | 30.83 |
| 44942.625 | 30.8 |
| 44942.635416666664 | 30.82 |
| 44942.645833333336 | 30.91 |
| 44942.65625 | 30.97 |
| 44942.666666666664 | 31.03 |
| 44942.677083333336 | 31.13 |
| 44942.6875 | 31.25 |
| 44942.697916666664 | 31.38 |
| 44942.708333333336 | 31.5 |
| 44942.71875 | 31.62 |
| 44942.729166666664 | 31.7 |
| 44942.739583333336 | 31.69 |
| 44942.75 | 31.71 |
| 44942.760416666664 | 31.73 |
| 44942.770833333336 | 31.73 |
| 44942.78125 | 31.72 |
| 44942.791666666664 | 31.71 |
| 44942.802083333336 | 31.71 |
| 44942.8125 | 31.71 |
| 44942.822916666664 | 31.71 |
| 44942.833333333336 | 31.71 |
| 44942.84375 | 31.72 |
| 44942.854166666664 | 31.72 |
| 44942.864583333336 | 31.72 |
| 44942.875 | 31.72 |
| 44942.885416666664 | 31.7 |
| 44942.895833333336 | 31.71 |
| 44942.90625 | 31.71 |
| 44942.916666666664 | 31.7 |
| 44942.927083333336 | 31.69 |
| 44942.9375 | 31.68 |
| 44942.947916666664 | 31.67 |
| 44942.958333333336 | 31.66 |
| 44942.96875 | 31.62 |
| 44942.979166666664 | 31.61 |
| 44942.989583333336 | 31.5 |
| 44943.0 | 31.51 |
| 44943.010416666664 | 31.33 |
| 44943.020833333336 | 31.34 |
| 44943.03125 | 31.25 |
| 44943.041666666664 | 31.15 |
| 44943.052083333336 | 30.91 |
| 44943.0625 | 30.8 |
| 44943.072916666664 | 30.67 |
| 44943.083333333336 | 30.55 |
| 44943.09375 | 30.51 |
| 44943.104166666664 | 30.53 |
| 44943.114583333336 | 30.5 |
| 44943.125 | 30.68 |
| 44943.135416666664 | 30.73 |
| 44943.145833333336 | 30.76 |
| 44943.15625 | 30.8 |
| 44943.166666666664 | 30.91 |
| 44943.177083333336 | 31 |
| 44943.1875 | 31.09 |
| 44943.197916666664 | 31.21 |
| 44943.208333333336 | 31.4 |
| 44943.21875 | 31.6 |
| 44943.229166666664 | 31.67 |
| 44943.239583333336 | 31.7 |
| 44943.25 | 31.72 |
| 44943.260416666664 | 31.72 |
| 44943.270833333336 | 31.71 |
| 44943.28125 | 31.69 |
| 44943.291666666664 | 31.6 |
| 44943.302083333336 | 31.66 |
| 44943.3125 | 31.75 |
| 44943.322916666664 | 31.76 |
| 44943.333333333336 | 31.78 |
| 44943.34375 | 31.79 |
| 44943.354166666664 | 31.82 |
| 44943.364583333336 | 31.85 |
| 44943.375 | 31.88 |
| 44943.385416666664 | 31.9 |
| 44943.395833333336 | 31.91 |
| 44943.40625 | 31.83 |
| 44943.416666666664 | 31.83 |
| 44943.427083333336 | 31.85 |
| 44943.4375 | 31.83 |
| 44943.447916666664 | 31.81 |
| 44943.458333333336 | 31.83 |
| 44943.46875 | 31.76 |
| 44943.479166666664 | 31.75 |
| 44943.489583333336 | 31.68 |
| 44943.5 | 31.62 |
| 44943.510416666664 | 31.57 |
| 44943.520833333336 | 31.52 |
| 44943.53125 | 31.47 |
| 44943.541666666664 | 31.44 |
| 44943.552083333336 | 31.38 |
| 44943.5625 | 31.25 |
| 44943.572916666664 | 31.15 |
| 44943.583333333336 | 31.03 |
| 44943.59375 | 30.9 |
| 44943.604166666664 | 30.76 |
| 44943.614583333336 | 30.69 |
| 44943.625 | 30.61 |
| 44943.635416666664 | 30.58 |
| 44943.645833333336 | 30.54 |
| 44943.65625 | 30.53 |
| 44943.666666666664 | 30.54 |
| 44943.677083333336 | 30.54 |
| 44943.6875 | 30.61 |
| 44943.697916666664 | 30.51 |
| 44943.708333333336 | 30.65 |
| 44943.71875 | 30.74 |
| 44943.729166666664 | 30.88 |
| 44943.739583333336 | 30.99 |
| 44943.75 | 31.21 |
| 44943.760416666664 | 31.45 |
| 44943.770833333336 | 31.58 |
| 44943.78125 | 31.65 |
| 44943.791666666664 | 31.67 |
| 44943.802083333336 | 31.7 |
| 44943.8125 | 31.71 |
| 44943.822916666664 | 31.73 |
| 44943.833333333336 | 31.73 |
| 44943.84375 | 31.71 |
| 44943.854166666664 | 31.7 |
| 44943.864583333336 | 31.7 |
| 44943.875 | 31.7 |
| 44943.885416666664 | 31.7 |
| 44943.895833333336 | 31.7 |
| 44943.90625 | 31.63 |
| 44943.916666666664 | 31.63 |
| 44943.927083333336 | 31.65 |
| 44943.9375 | 31.65 |
| 44943.947916666664 | 31.64 |
| 44943.958333333336 | 31.63 |
| 44943.96875 | 31.6 |
| 44943.979166666664 | 31.59 |
| 44943.989583333336 | 31.58 |
| 44944.0 | 31.57 |
| 44944.010416666664 | 31.58 |
| 44944.020833333336 | 31.5 |
| 44944.03125 | 31.33 |
| 44944.041666666664 | 31.06 |
| 44944.052083333336 | 30.89 |
| 44944.0625 | 30.55 |
| 44944.072916666664 | 30.33 |
| 44944.083333333336 | 30.2 |
| 44944.09375 | 30.1 |
| 44944.104166666664 | 30.04 |
| 44944.114583333336 | 29.98 |
| 44944.125 | 29.95 |
| 44944.135416666664 | 29.61 |
| 44944.145833333336 | 29.91 |
| 44944.15625 | 29.91 |
| 44944.166666666664 | 29.99 |
| 44944.177083333336 | 30.05 |
| 44944.1875 | 30.09 |
| 44944.197916666664 | 30.19 |
| 44944.208333333336 | 30.31 |
| 44944.21875 | 30.77 |
| 44944.229166666664 | 30.95 |
| 44944.239583333336 | 31.12 |
| 44944.25 | 31.19 |
| 44944.260416666664 | 31.3 |
| 44944.270833333336 | 31.43 |
| 44944.28125 | 31.54 |
| 44944.291666666664 | 31.6 |
| 44944.302083333336 | 31.65 |
| 44944.3125 | 31.71 |
| 44944.322916666664 | 31.72 |
| 44944.333333333336 | 31.78 |
| 44944.34375 | 31.84 |
| 44944.354166666664 | 31.88 |
| 44944.364583333336 | 31.89 |
| 44944.375 | 31.9 |
| 44944.385416666664 | 31.9 |
| 44944.395833333336 | 31.9 |
| 44944.40625 | 31.91 |
| 44944.416666666664 | 31.91 |
| 44944.427083333336 | 31.91 |
| 44944.4375 | 31.82 |
| 44944.447916666664 | 31.85 |
| 44944.458333333336 | 31.86 |
| 44944.46875 | 31.85 |
| 44944.479166666664 | 31.84 |
| 44944.489583333336 | 31.84 |
| 44944.5 | 31.8 |
| 44944.510416666664 | 31.78 |
| 44944.520833333336 | 31.71 |
| 44944.53125 | 31.76 |
| 44944.541666666664 | 31.66 |
| 44944.552083333336 | 31.58 |
| 44944.5625 | 31.52 |
| 44944.572916666664 | 30.91 |
| 44944.583333333336 | 31.31 |
| 44944.59375 | 31.11 |
| 44944.604166666664 | 30.78 |
| 44944.614583333336 | 30.65 |
| 44944.625 | 30.44 |
| 44944.635416666664 | 30.3 |
| 44944.645833333336 | 30.15 |
| 44944.65625 | 30.02 |
| 44944.666666666664 | 29.86 |
| 44944.677083333336 | 29.76 |
| 44944.6875 | 29.69 |
| 44944.697916666664 | 29.65 |
| 44944.708333333336 | 29.8 |
| 44944.71875 | 29.93 |
| 44944.729166666664 | 30 |
| 44944.739583333336 | 30.12 |
| 44944.75 | 30.21 |
| 44944.760416666664 | 30.51 |
| 44944.770833333336 | 30.78 |
| 44944.78125 | 31.03 |
| 44944.791666666664 | 31.03 |
| 44944.802083333336 | 31.17 |
| 44944.8125 | 31.35 |
| 44944.822916666664 | 31.44 |
| 44944.833333333336 | 31.53 |
| 44944.84375 | 31.59 |
| 44944.854166666664 | 31.65 |
| 44944.864583333336 | 31.71 |
| 44944.875 | 31.75 |
| 44944.885416666664 | 31.82 |
| 44944.895833333336 | 31.86 |
| 44944.90625 | 31.89 |
| 44944.916666666664 | 31.92 |
| 44944.927083333336 | 31.94 |
| 44944.9375 | 31.96 |
| 44944.947916666664 | 31.98 |
| 44944.958333333336 | 31.86 |
| 44944.96875 | 31.88 |
| 44944.979166666664 | 31.89 |
| 44944.989583333336 | 31.86 |
| 44945.0 | 31.86 |
| 44945.010416666664 | 31.85 |
| 44945.020833333336 | 31.82 |
| 44945.03125 | 31.7 |
| 44945.041666666664 | 31.49 |
| 44945.052083333336 | 31.26 |
| 44945.0625 | 30.95 |
| 44945.072916666664 | 30.59 |
| 44945.083333333336 | 30.41 |
| 44945.09375 | 30.31 |
| 44945.104166666664 | 30.14 |
| 44945.114583333336 | 29.99 |
| 44945.125 | 29.83 |
| 44945.135416666664 | 29.69 |
| 44945.145833333336 | 29.55 |
| 44945.15625 | 29.55 |
| 44945.166666666664 | 29.52 |
| 44945.177083333336 | 29.51 |
| 44945.1875 | 29.51 |
| 44945.197916666664 | 29.6 |
| 44945.208333333336 | 29.63 |
| 44945.21875 | 29.67 |
| 44945.229166666664 | 29.77 |
| 44945.239583333336 | 29.95 |
| 44945.25 | 30.25 |
| 44945.260416666664 | 30.53 |
| 44945.270833333336 | 30.83 |
| 44945.28125 | 31.1 |
| 44945.291666666664 | 31.3 |
| 44945.302083333336 | 31.39 |
| 44945.3125 | 31.48 |
| 44945.322916666664 | 31.61 |
| 44945.333333333336 | 31.71 |
| 44945.34375 | 31.79 |
| 44945.354166666664 | 31.86 |
| 44945.364583333336 | 31.92 |
| 44945.375 | 31.97 |
| 44945.385416666664 | 32 |
| 44945.395833333336 | 32.02 |
| 44945.40625 | 32.03 |
| 44945.416666666664 | 32.04 |
| 44945.427083333336 | 32.03 |
| 44945.4375 | 32.03 |
| 44945.447916666664 | 32.04 |
| 44945.458333333336 | 32.02 |
| 44945.46875 | 32.04 |
| 44945.479166666664 | 31.32 |
| 44945.489583333336 | 31.87 |
| 44945.5 | 30.76 |
| 44945.510416666664 | 31.9 |
| 44945.520833333336 | 32 |
| 44945.53125 | 31.9 |
| 44945.541666666664 | 31.94 |
| 44945.552083333336 | 31.93 |
| 44945.5625 | 31.9 |
| 44945.572916666664 | 31.87 |
| 44945.583333333336 | 31.83 |
| 44945.59375 | 31.78 |
| 44945.604166666664 | 31.73 |
| 44945.614583333336 | 31.61 |
| 44945.625 | 31.55 |
| 44945.635416666664 | 31.46 |
| 44945.645833333336 | 31.32 |
| 44945.65625 | 31.09 |
| 44945.666666666664 | 30.9 |
| 44945.677083333336 | 30.74 |
| 44945.6875 | 30.59 |
| 44945.697916666664 | 30.47 |
| 44945.708333333336 | 30.36 |
| 44945.71875 | 30.29 |
| 44945.729166666664 | 30.27 |
| 44945.739583333336 | 30.35 |
| 44945.75 | 30.41 |
| 44945.760416666664 | 30.44 |
| 44945.770833333336 | 30.5 |
| 44945.78125 | 30.66 |
| 44945.791666666664 | 30.84 |
| 44945.802083333336 | 31.04 |
| 44945.8125 | 31.23 |
| 44945.822916666664 | 31.36 |
| 44945.833333333336 | 31.43 |
| 44945.84375 | 31.5 |
| 44945.854166666664 | 31.57 |
| 44945.864583333336 | 31.61 |
| 44945.875 | 31.65 |
| 44945.885416666664 | 31.71 |
| 44945.895833333336 | 31.78 |
| 44945.90625 | 31.84 |
| 44945.916666666664 | 31.88 |
| 44945.927083333336 | 31.92 |
| 44945.9375 | 31.97 |
| 44945.947916666664 | 31.98 |
| 44945.958333333336 | 31.99 |
| 44945.96875 | 31.99 |
| 44945.979166666664 | 31.93 |
| 44945.989583333336 | 31.92 |
| 44946.0 | 31.92 |
| 44946.010416666664 | 31.88 |
| 44946.020833333336 | 31.85 |
| 44946.03125 | 31.84 |
| 44946.041666666664 | 31.83 |
| 44946.052083333336 | 31.82 |
| 44946.0625 | 31.8 |
| 44946.072916666664 | 31.66 |
| 44946.083333333336 | 31.69 |
| 44946.09375 | 31.65 |
| 44946.104166666664 | 31.52 |
| 44946.114583333336 | 31.41 |
| 44946.125 | 31.23 |
| 44946.135416666664 | 31.04 |
| 44946.145833333336 | 30.87 |
| 44946.15625 | 30.67 |
| 44946.166666666664 | 30.52 |
| 44946.177083333336 | 30.42 |
| 44946.1875 | 30.29 |
| 44946.197916666664 | 30.18 |
| 44946.208333333336 | 30.13 |
| 44946.21875 | 30.03 |
| 44946.229166666664 | 30.04 |
| 44946.239583333336 | 30.16 |
| 44946.25 | 30.22 |
| 44946.260416666664 | 30.22 |
| 44946.270833333336 | 30.32 |
| 44946.28125 | 30.45 |
| 44946.291666666664 | 30.71 |
| 44946.302083333336 | 31.02 |
| 44946.3125 | 31.24 |
| 44946.322916666664 | 31.31 |
| 44946.333333333336 | 31.4 |
| 44946.34375 | 31.51 |
| 44946.354166666664 | 31.61 |
| 44946.364583333336 | 31.67 |
| 44946.375 | 31.75 |
| 44946.385416666664 | 31.83 |
| 44946.395833333336 | 31.91 |
| 44946.40625 | 31.97 |
| 44946.416666666664 | 32 |
| 44946.427083333336 | 32.02 |
| 44946.4375 | 32.03 |
| 44946.447916666664 | 32.04 |
| 44946.458333333336 | 32.05 |
| 44946.46875 | 32.06 |
| 44946.479166666664 | 32.07 |
| 44946.489583333336 | 32.07 |
| 44946.5 | 31.9 |
| 44946.510416666664 | 32.08 |
| 44946.520833333336 | 32.07 |
| 44946.53125 | 32.04 |
| 44946.541666666664 | 32 |
| 44946.552083333336 | 32.03 |
| 44946.5625 | 32.01 |
| 44946.572916666664 | 32 |
| 44946.583333333336 | 31.97 |
| 44946.59375 | 31.97 |
| 44946.604166666664 | 31.94 |
| 44946.614583333336 | 31.91 |
| 44946.625 | 31.87 |
| 44946.635416666664 | 31.81 |
| 44946.645833333336 | 31.75 |
| 44946.65625 | 31.75 |
| 44946.666666666664 | 31.7 |
| 44946.677083333336 | 31.53 |
| 44946.6875 | 31.47 |
| 44946.697916666664 | 31.3 |
| 44946.708333333336 | 31.17 |
| 44946.71875 | 31.13 |
| 44946.729166666664 | 30.83 |
| 44946.739583333336 | 30.65 |
| 44946.75 | 30.51 |
| 44946.760416666664 | 30.41 |
| 44946.770833333336 | 30.36 |
| 44946.78125 | 30.51 |
| 44946.791666666664 | 30.58 |
| 44946.802083333336 | 30.55 |
| 44946.8125 | 30.62 |
| 44946.822916666664 | 30.7 |
| 44946.833333333336 | 30.97 |
| 44946.84375 | 31.22 |
| 44946.854166666664 | 31.36 |
| 44946.864583333336 | 31.38 |
| 44946.875 | 31.43 |
| 44946.885416666664 | 31.5 |
| 44946.895833333336 | 31.56 |
| 44946.90625 | 31.63 |
| 44946.916666666664 | 31.68 |
| 44946.927083333336 | 31.76 |
| 44946.9375 | 31.84 |
| 44946.947916666664 | 31.89 |
| 44946.958333333336 | 31.94 |
| 44946.96875 | 31.98 |
| 44946.979166666664 | 31.99 |
| 44946.989583333336 | 32 |
| 44947.0 | 32 |
| 44947.010416666664 | 31.96 |
| 44947.020833333336 | 31.96 |
| 44947.03125 | 31.97 |
| 44947.041666666664 | 31.99 |
| 44947.052083333336 | 31.96 |
| 44947.0625 | 31.92 |
| 44947.072916666664 | 31.92 |
| 44947.083333333336 | 31.88 |
| 44947.09375 | 31.87 |
| 44947.104166666664 | 31.79 |
| 44947.114583333336 | 31.69 |
| 44947.125 | 31.68 |
| 44947.135416666664 | 31.56 |
| 44947.145833333336 | 31.48 |
| 44947.15625 | 31.37 |
| 44947.166666666664 | 31.1 |
| 44947.177083333336 | 30.82 |
| 44947.1875 | 30.64 |
| 44947.197916666664 | 30.53 |
| 44947.208333333336 | 30.34 |
| 44947.21875 | 30.26 |
| 44947.229166666664 | 30.13 |
| 44947.239583333336 | 30.16 |
| 44947.25 | 30.19 |
| 44947.260416666664 | 30.22 |
| 44947.270833333336 | 30.23 |
| 44947.28125 | 30.23 |
| 44947.291666666664 | 30.24 |
| 44947.302083333336 | 30.2 |
| 44947.3125 | 30.17 |
| 44947.322916666664 | 30.21 |
| 44947.333333333336 | 30.54 |
| 44947.34375 | 30.96 |
| 44947.354166666664 | 31.35 |
| 44947.364583333336 | 31.45 |
| 44947.375 | 31.43 |
| 44947.385416666664 | 31.42 |
| 44947.395833333336 | 31.47 |
| 44947.40625 | 31.63 |
| 44947.416666666664 | 31.77 |
| 44947.427083333336 | 31.87 |
| 44947.4375 | 31.98 |
| 44947.447916666664 | 31.99 |
| 44947.458333333336 | 32.02 |
| 44947.46875 | 32.04 |
| 44947.479166666664 | 32.04 |
| 44947.489583333336 | 32.07 |
| 44947.5 | 32.07 |
| 44947.510416666664 | 32.09 |
| 44947.520833333336 | 32.1 |
| 44947.53125 | 32.1 |
| 44947.541666666664 | 32.1 |
| 44947.552083333336 | 32.11 |
| 44947.5625 | 32.06 |
| 44947.572916666664 | 32.03 |
| 44947.583333333336 | 32.04 |
| 44947.59375 | 32.02 |
| 44947.604166666664 | 32.02 |
| 44947.614583333336 | 32.01 |
| 44947.625 | 32 |
| 44947.635416666664 | 31.97 |
| 44947.645833333336 | 31.96 |
| 44947.65625 | 31.94 |
| 44947.666666666664 | 31.88 |
| 44947.677083333336 | 31.87 |
| 44947.6875 | 31.87 |
| 44947.697916666664 | 31.84 |
| 44947.708333333336 | 31.84 |
| 44947.71875 | 31.79 |
| 44947.729166666664 | 31.62 |
| 44947.739583333336 | 31.38 |
| 44947.75 | 31.18 |
| 44947.760416666664 | 30.8 |
| 44947.770833333336 | 30.92 |
| 44947.78125 | 30.7 |
| 44947.791666666664 | 30.59 |
| 44947.802083333336 | 30.56 |
| 44947.8125 | 30.5 |
| 44947.822916666664 | 30.71 |
| 44947.833333333336 | 30.67 |
| 44947.84375 | 30.67 |
| 44947.854166666664 | 30.74 |
| 44947.864583333336 | 30.82 |
| 44947.875 | 31.08 |
| 44947.885416666664 | 31.33 |
| 44947.895833333336 | 31.46 |
| 44947.90625 | 31.52 |
| 44947.916666666664 | 31.61 |
| 44947.927083333336 | 31.7 |
| 44947.9375 | 31.78 |
| 44947.947916666664 | 31.86 |
| 44947.958333333336 | 31.93 |
| 44947.96875 | 31.97 |
| 44947.979166666664 | 32.01 |
| 44947.989583333336 | 32.04 |
| 44948.0 | 32.06 |
| 44948.010416666664 | 32.08 |
| 44948.020833333336 | 32.08 |
| 44948.03125 | 32.09 |
| 44948.041666666664 | 32.09 |
| 44948.052083333336 | 32.1 |
| 44948.0625 | 32.05 |
| 44948.072916666664 | 32.03 |
| 44948.083333333336 | 32.06 |
| 44948.09375 | 32.05 |
| 44948.104166666664 | 32.04 |
| 44948.114583333336 | 32.03 |
| 44948.125 | 32.02 |
| 44948.135416666664 | 31.99 |
| 44948.145833333336 | 31.96 |
| 44948.15625 | 31.95 |
| 44948.166666666664 | 31.87 |
| 44948.177083333336 | 31.83 |
| 44948.1875 | 31.83 |
| 44948.197916666664 | 31.82 |
| 44948.208333333336 | 31.76 |
| 44948.21875 | 31.66 |
| 44948.229166666664 | 31.49 |
| 44948.239583333336 | 31.37 |
| 44948.25 | 31.22 |
| 44948.260416666664 | 31.05 |
| 44948.270833333336 | 30.96 |
| 44948.28125 | 30.88 |
| 44948.291666666664 | 30.87 |
| 44948.302083333336 | 30.79 |
| 44948.3125 | 30.67 |
| 44948.322916666664 | 30.69 |
| 44948.333333333336 | 30.79 |
| 44948.34375 | 30.74 |
| 44948.354166666664 | 30.83 |
| 44948.364583333336 | 30.96 |
| 44948.375 | 31.2 |
| 44948.385416666664 | 31.36 |
| 44948.395833333336 | 31.52 |
| 44948.40625 | 31.59 |
| 44948.416666666664 | 31.67 |
| 44948.427083333336 | 31.75 |
| 44948.4375 | 31.79 |
| 44948.447916666664 | 31.88 |
| 44948.458333333336 | 31.95 |
| 44948.46875 | 32.01 |
| 44948.479166666664 | 32.04 |
| 44948.489583333336 | 32.08 |
| 44948.5 | 32.09 |
| 44948.510416666664 | 32.1 |
| 44948.520833333336 | 32.12 |
| 44948.53125 | 32.13 |
| 44948.541666666664 | 32.14 |
| 44948.552083333336 | 32.14 |
| 44948.5625 | 32.13 |
| 44948.572916666664 | 32.13 |
| 44948.583333333336 | 32.14 |
| 44948.59375 | 32.13 |
| 44948.604166666664 | 32.13 |
| 44948.614583333336 | 32.07 |
| 44948.625 | 32.04 |
| 44948.635416666664 | 32.12 |
| 44948.645833333336 | 32.12 |
| 44948.65625 | 32.09 |
| 44948.666666666664 | 32.08 |
| 44948.677083333336 | 32.05 |
| 44948.6875 | 32.02 |
| 44948.697916666664 | 31.97 |
| 44948.708333333336 | 31.92 |
| 44948.71875 | 31.88 |
| 44948.729166666664 | 31.76 |
| 44948.739583333336 | 31.78 |
| 44948.75 | 31.75 |
| 44948.760416666664 | 31.71 |
| 44948.770833333336 | 31.67 |
| 44948.78125 | 31.56 |
| 44948.791666666664 | 31.47 |
| 44948.802083333336 | 31.29 |
| 44948.8125 | 31.13 |
| 44948.822916666664 | 30.94 |
| 44948.833333333336 | 30.81 |
| 44948.84375 | 30.71 |
| 44948.854166666664 | 30.65 |
| 44948.864583333336 | 30.71 |
| 44948.875 | 30.8 |
| 44948.885416666664 | 30.6 |
| 44948.895833333336 | 30.92 |
| 44948.90625 | 31.09 |
| 44948.916666666664 | 31.25 |
| 44948.927083333336 | 31.43 |
| 44948.9375 | 31.56 |
| 44948.947916666664 | 31.63 |
| 44948.958333333336 | 31.66 |
| 44948.96875 | 31.72 |
| 44948.979166666664 | 31.77 |
| 44948.989583333336 | 31.82 |
| 44949.0 | 31.88 |
| 44949.010416666664 | 31.89 |
| 44949.020833333336 | 31.92 |
| 44949.03125 | 31.92 |
| 44949.041666666664 | 31.92 |
| 44949.052083333336 | 31.91 |
| 44949.0625 | 31.91 |
| 44949.072916666664 | 31.92 |
| 44949.083333333336 | 31.92 |
| 44949.09375 | 31.91 |
| 44949.104166666664 | 31.89 |
| 44949.114583333336 | 31.6 |
| 44949.125 | 31.66 |
| 44949.135416666664 | 31.76 |
| 44949.145833333336 | 31.75 |
| 44949.15625 | 31.76 |
| 44949.166666666664 | 31.7 |
| 44949.177083333336 | 31.72 |
| 44949.1875 | 31.59 |
| 44949.197916666664 | 31.49 |
| 44949.208333333336 | 31.43 |
| 44949.21875 | 31.35 |
| 44949.229166666664 | 31.3 |
| 44949.239583333336 | 31.17 |
| 44949.25 | 31.12 |
| 44949.260416666664 | 31.02 |
| 44949.270833333336 | 30.93 |
| 44949.28125 | 30.84 |
| 44949.291666666664 | 30.73 |
| 44949.302083333336 | 30.59 |
| 44949.3125 | 30.39 |
| 44949.322916666664 | 30.13 |
| 44949.333333333336 | 29.98 |
| 44949.34375 | 29.92 |
| 44949.354166666664 | 30.03 |
| 44949.364583333336 | 30.14 |
| 44949.375 | 30.19 |
| 44949.385416666664 | 30.31 |
| 44949.395833333336 | 30.45 |
| 44949.40625 | 30.65 |
| 44949.416666666664 | 30.84 |
| 44949.427083333336 | 30.93 |
| 44949.4375 | 31.03 |
| 44949.447916666664 | 31.08 |
| 44949.458333333336 | 31.14 |
| 44949.46875 | 31.19 |
| 44949.479166666664 | 31.26 |
| 44949.489583333336 | 31.37 |
| 44949.5 | 31.47 |
| 44949.510416666664 | 31.58 |
| 44949.520833333336 | 31.66 |
| 44949.53125 | 31.67 |
| 44949.541666666664 | 31.66 |
| 44949.552083333336 | 31.68 |
| 44949.5625 | 31.69 |
| 44949.572916666664 | 31.7 |
| 44949.583333333336 | 31.7 |
| 44949.59375 | 31.71 |
| 44949.604166666664 | 31.71 |
| 44949.614583333336 | 31.71 |
| 44949.625 | 31.71 |
| 44949.635416666664 | 31.64 |
| 44949.645833333336 | 31.67 |
| 44949.65625 | 31.66 |
| 44949.666666666664 | 31.64 |
| 44949.677083333336 | 31.64 |
| 44949.6875 | 31.61 |
| 44949.697916666664 | 31.57 |
| 44949.708333333336 | 31.52 |
| 44949.71875 | 31.51 |
| 44949.729166666664 | 31.47 |
| 44949.739583333336 | 31.4 |
| 44949.75 | 31.37 |
| 44949.760416666664 | 31.28 |
| 44949.770833333336 | 31.27 |
| 44949.78125 | 31.23 |
| 44949.791666666664 | 31.03 |
| 44949.802083333336 | 31.08 |
| 44949.8125 | 30.91 |
| 44949.822916666664 | 30.67 |
| 44949.833333333336 | 30.28 |
| 44949.84375 | 29.96 |
| 44949.854166666664 | 29.66 |
| 44949.864583333336 | 29.31 |
| 44949.875 | 29.19 |
| 44949.885416666664 | 29.26 |
| 44949.895833333336 | 29.25 |
| 44949.90625 | 29.37 |
| 44949.916666666664 | 29.24 |
| 44949.927083333336 | 29.43 |
| 44949.9375 | 29.8 |
| 44949.947916666664 | 30.32 |
| 44949.958333333336 | 30.67 |
| 44949.96875 | 30.77 |
| 44949.979166666664 | 30.79 |
| 44949.989583333336 | 30.83 |
| 44950.0 | 30.92 |
| 44950.010416666664 | 31.02 |
| 44950.020833333336 | 31.13 |
| 44950.03125 | 31.21 |
| 44950.041666666664 | 31.28 |
| 44950.052083333336 | 31.37 |
| 44950.0625 | 31.44 |
| 44950.072916666664 | 31.49 |
| 44950.083333333336 | 31.53 |
| 44950.09375 | 31.56 |
| 44950.104166666664 | 31.58 |
| 44950.114583333336 | 31.59 |
| 44950.125 | 31.59 |
| 44950.135416666664 | 31.57 |
| 44950.145833333336 | 31.48 |
| 44950.15625 | 31.54 |
| 44950.166666666664 | 31.49 |
| 44950.177083333336 | 31.48 |
| 44950.1875 | 31.44 |
| 44950.197916666664 | 31.4 |
| 44950.208333333336 | 31.34 |
| 44950.21875 | 31.32 |
| 44950.229166666664 | 31.25 |
| 44950.239583333336 | 31.17 |
| 44950.25 | 31.08 |
| 44950.260416666664 | 30.74 |
| 44950.270833333336 | 30.53 |
| 44950.28125 | 30.46 |
| 44950.291666666664 | 30.29 |
| 44950.302083333336 | 30.15 |
| 44950.3125 | 30.03 |
| 44950.322916666664 | 29.84 |
| 44950.333333333336 | 29.58 |
| 44950.34375 | 29.32 |
| 44950.354166666664 | 29.24 |
| 44950.364583333336 | 29.22 |
| 44950.375 | 29.18 |
| 44950.385416666664 | 29.12 |
| 44950.395833333336 | 29.14 |
| 44950.40625 | 29.27 |
| 44950.416666666664 | 29.19 |
| 44950.427083333336 | 29.25 |
| 44950.4375 | 29.45 |
| 44950.447916666664 | 29.87 |
| 44950.458333333336 | 30.08 |
| 44950.46875 | 30.45 |
| 44950.479166666664 | 30.61 |
| 44950.489583333336 | 30.77 |
| 44950.5 | 30.92 |
| 44950.510416666664 | 31.05 |
| 44950.520833333336 | 31.2 |
| 44950.53125 | 31.3 |
| 44950.541666666664 | 31.4 |
| 44950.552083333336 | 31.46 |
| 44950.5625 | 31.47 |
| 44950.572916666664 | 31.5 |
| 44950.583333333336 | 31.53 |
| 44950.59375 | 31.54 |
| 44950.604166666664 | 31.53 |
| 44950.614583333336 | 31.53 |
| 44950.625 | 31.54 |
| 44950.635416666664 | 31.54 |
| 44950.645833333336 | 31.55 |
| 44950.65625 | 31.54 |
| 44950.666666666664 | 31.44 |
| 44950.677083333336 | 31.5 |
| 44950.6875 | 31.48 |
| 44950.697916666664 | 31.51 |
| 44950.708333333336 | 31.5 |
| 44950.71875 | 31.48 |
| 44950.729166666664 | 31.45 |
| 44950.739583333336 | 31.44 |
| 44950.75 | 31.42 |
| 44950.760416666664 | 31.35 |
| 44950.770833333336 | 31.35 |
| 44950.78125 | 31.31 |
| 44950.791666666664 | 31.28 |
| 44950.802083333336 | 31.21 |
| 44950.8125 | 31.02 |
| 44950.822916666664 | 30.73 |
| 44950.833333333336 | 30.28 |
| 44950.84375 | 30.08 |
| 44950.854166666664 | 29.83 |
| 44950.864583333336 | 29.62 |
| 44950.875 | 29.49 |
| 44950.885416666664 | 29.39 |
| 44950.895833333336 | 29.28 |
| 44950.90625 | 29.36 |
| 44950.916666666664 | 29.35 |
| 44950.927083333336 | 29.34 |
| 44950.9375 | 29.36 |
| 44950.947916666664 | 29.31 |
| 44950.958333333336 | 29.34 |
| 44950.96875 | 29.51 |
| 44950.979166666664 | 29.78 |
| 44950.989583333336 | 29.96 |
| 44951.0 | 30.27 |
| 44951.010416666664 | 30.46 |
| 44951.020833333336 | 30.62 |
| 44951.03125 | 30.73 |
| 44951.041666666664 | 30.86 |
| 44951.052083333336 | 30.97 |
| 44951.0625 | 31.09 |
| 44951.072916666664 | 31.22 |
| 44951.083333333336 | 31.31 |
| 44951.09375 | 31.4 |
| 44951.104166666664 | 31.42 |
| 44951.114583333336 | 31.46 |
| 44951.125 | 31.5 |
| 44951.135416666664 | 31.52 |
| 44951.145833333336 | 31.54 |
| 44951.15625 | 31.54 |
| 44951.166666666664 | 31.54 |
| 44951.177083333336 | 31.42 |
| 44951.1875 | 31.45 |
| 44951.197916666664 | 31.43 |
| 44951.208333333336 | 31.45 |
| 44951.21875 | 31.4 |
| 44951.229166666664 | 31.34 |
| 44951.239583333336 | 31.3 |
| 44951.25 | 31.27 |
| 44951.260416666664 | 31.22 |
| 44951.270833333336 | 31.11 |
| 44951.28125 | 30.99 |
| 44951.291666666664 | 30.81 |
| 44951.302083333336 | 30.57 |
| 44951.3125 | 30.35 |
| 44951.322916666664 | 30.12 |
| 44951.333333333336 | 29.92 |
| 44951.34375 | 29.79 |
| 44951.354166666664 | 29.58 |
| 44951.364583333336 | 29.51 |
| 44951.375 | 29.45 |
| 44951.385416666664 | 29.39 |
| 44951.395833333336 | 29.37 |
| 44951.40625 | 29.36 |
| 44951.416666666664 | 29.38 |
| 44951.427083333336 | 29.38 |
| 44951.4375 | 29.4 |
| 44951.447916666664 | 29.39 |
| 44951.458333333336 | 29.38 |
| 44951.46875 | 29.38 |
| 44951.479166666664 | 29.43 |
| 44951.489583333336 | 29.77 |
| 44951.5 | 29.94 |
| 44951.510416666664 | 30.25 |
| 44951.520833333336 | 30.49 |
| 44951.53125 | 30.65 |
| 44951.541666666664 | 30.83 |
| 44951.552083333336 | 30.98 |
| 44951.5625 | 31.12 |
| 44951.572916666664 | 31.26 |
| 44951.583333333336 | 31.35 |
| 44951.59375 | 31.42 |
| 44951.604166666664 | 31.45 |
| 44951.614583333336 | 31.53 |
| 44951.625 | 31.34 |
| 44951.635416666664 | 31.55 |
| 44951.645833333336 | 31.54 |
| 44951.65625 | 31.55 |
| 44951.666666666664 | 31.55 |
| 44951.677083333336 | 31.56 |
| 44951.6875 | 31.56 |
| 44951.697916666664 | 31.57 |
| 44951.708333333336 | 31.44 |
| 44951.71875 | 31.56 |
| 44951.729166666664 | 31.53 |
| 44951.739583333336 | 31.53 |
| 44951.75 | 31.51 |
| 44951.760416666664 | 31.48 |
| 44951.770833333336 | 31.43 |
| 44951.78125 | 31.37 |
| 44951.791666666664 | 31.32 |
| 44951.802083333336 | 31.3 |
| 44951.8125 | 31.27 |
| 44951.822916666664 | 31.11 |
| 44951.833333333336 | 31.11 |
| 44951.84375 | 30.98 |
| 44951.854166666664 | 30.85 |
| 44951.864583333336 | 30.67 |
| 44951.875 | 30.5 |
| 44951.885416666664 | 30.26 |
| 44951.895833333336 | 30 |
| 44951.90625 | 29.71 |
| 44951.916666666664 | 29.56 |
| 44951.927083333336 | 29.51 |
| 44951.9375 | 29.52 |
| 44951.947916666664 | 29.49 |
| 44951.958333333336 | 29.47 |
| 44951.96875 | 29.53 |
| 44951.979166666664 | 29.48 |
| 44951.989583333336 | 29.9 |
| 44952.0 | 30.11 |
| 44952.010416666664 | 30.42 |
| 44952.020833333336 | 30.48 |
| 44952.03125 | 30.58 |
| 44952.041666666664 | 30.67 |
| 44952.052083333336 | 30.73 |
| 44952.0625 | 30.77 |
| 44952.072916666664 | 30.8 |
| 44952.083333333336 | 30.81 |
| 44952.09375 | 30.8 |
| 44952.104166666664 | 30.8 |
| 44952.114583333336 | 30.75 |
| 44952.125 | 30.65 |
| 44952.135416666664 | 30.56 |
| 44952.145833333336 | 30.56 |
| 44952.15625 | 30.67 |
| 44952.166666666664 | 30.69 |
| 44952.177083333336 | 30.68 |
| 44952.1875 | 30.72 |
| 44952.197916666664 | 30.6 |
| 44952.208333333336 | 30.81 |
| 44952.21875 | 30.77 |
| 44952.229166666664 | 30.66 |
| 44952.239583333336 | 30.6 |
| 44952.25 | 30.59 |
| 44952.260416666664 | 30.45 |
| 44952.270833333336 | 30.16 |
| 44952.28125 | 30.01 |
| 44952.291666666664 | 29.53 |
| 44952.302083333336 | 29.62 |
| 44952.3125 | 29.22 |
| 44952.322916666664 | 28.95 |
| 44952.333333333336 | 29.03 |
| 44952.34375 | 28.72 |
| 44952.354166666664 | 28.86 |
| 44952.364583333336 | 28.91 |
| 44952.375 | 28.9 |
| 44952.385416666664 | 28.75 |
| 44952.395833333336 | 28.49 |
| 44952.40625 | 28.13 |
| 44952.416666666664 | 27.77 |
| 44952.427083333336 | 27.46 |
| 44952.4375 | 27.11 |
| 44952.447916666664 | 26.74 |
| 44952.458333333336 | 26.48 |
| 44952.46875 | 26.45 |
| 44952.479166666664 | 26.63 |
| 44952.489583333336 | 26.96 |
| 44952.5 | 27.19 |
| 44952.510416666664 | 27.48 |
| 44952.520833333336 | 28.1 |
| 44952.53125 | 28.44 |
| 44952.541666666664 | 28.69 |
| 44952.552083333336 | 28.84 |
| 44952.5625 | 28.99 |
| 44952.572916666664 | 29.13 |
| 44952.583333333336 | 29.25 |
| 44952.59375 | 29.36 |
| 44952.604166666664 | 29.49 |
| 44952.614583333336 | 29.62 |
| 44952.625 | 29.74 |
| 44952.635416666664 | 29.89 |
| 44952.645833333336 | 30.13 |
| 44952.65625 | 30.32 |
| 44952.666666666664 | 30.44 |
| 44952.677083333336 | 30.49 |
| 44952.6875 | 30.52 |
| 44952.697916666664 | 30.53 |
| 44952.708333333336 | 30.54 |
| 44952.71875 | 30.55 |
| 44952.729166666664 | 30.53 |
| 44952.739583333336 | 30.5 |
| 44952.75 | 30.52 |
| 44952.760416666664 | 30.51 |
| 44952.770833333336 | 30.46 |
| 44952.78125 | 30.14 |
| 44952.791666666664 | 30.21 |
| 44952.802083333336 | 30.1 |
| 44952.8125 | 29.93 |
| 44952.822916666664 | 29.94 |
| 44952.833333333336 | 29.79 |
| 44952.84375 | 29.59 |
| 44952.854166666664 | 29.5 |
| 44952.864583333336 | 29.24 |
| 44952.875 | 28.85 |
| 44952.885416666664 | 27.74 |
| 44952.895833333336 | 26.83 |
| 44952.90625 | 26.06 |
| 44952.916666666664 | 25.69 |
| 44952.927083333336 | 25.31 |
| 44952.9375 | 24.92 |
| 44952.947916666664 | 24.68 |
| 44952.958333333336 | 24.37 |
| 44952.96875 | 24.27 |
| 44952.979166666664 | 24.2 |
| 44952.989583333336 | 24.21 |
| 44953.0 | 24.46 |
| 44953.010416666664 | 24.61 |
| 44953.020833333336 | 24.94 |
| 44953.03125 | 25.31 |
| 44953.041666666664 | 26.56 |
| 44953.052083333336 | 27.26 |
| 44953.0625 | 27.43 |
| 44953.072916666664 | 27.88 |
| 44953.083333333336 | 28.36 |
| 44953.09375 | 28.85 |
| 44953.104166666664 | 29.03 |
| 44953.114583333336 | 29.19 |
| 44953.125 | 29.42 |
| 44953.135416666664 | 29.61 |
| 44953.145833333336 | 29.79 |
| 44953.15625 | 29.94 |
| 44953.166666666664 | 30.11 |
| 44953.177083333336 | 30.28 |
| 44953.1875 | 30.4 |
| 44953.197916666664 | 30.48 |
| 44953.208333333336 | 30.52 |
| 44953.21875 | 30.55 |
| 44953.229166666664 | 30.53 |
| 44953.239583333336 | 30.53 |
| 44953.25 | 30.47 |
| 44953.260416666664 | 30.51 |
| 44953.270833333336 | 30.47 |
| 44953.28125 | 30.43 |
| 44953.291666666664 | 30.42 |
| 44953.302083333336 | 30.36 |
| 44953.3125 | 30.28 |
| 44953.322916666664 | 29.71 |
| 44953.333333333336 | 29.55 |
| 44953.34375 | 29.25 |
| 44953.354166666664 | 28.96 |
| 44953.364583333336 | 28.74 |
| 44953.375 | 28.15 |
| 44953.385416666664 | 27.56 |
| 44953.395833333336 | 27.04 |
| 44953.40625 | 26.63 |
| 44953.416666666664 | 26.25 |
| 44953.427083333336 | 25.99 |
| 44953.4375 | 25.67 |
| 44953.447916666664 | 25.33 |
| 44953.458333333336 | 25 |
| 44953.46875 | 24.8 |
| 44953.479166666664 | 24.73 |
| 44953.489583333336 | 24.43 |
| 44953.5 | 24.37 |
| 44953.510416666664 | 24.36 |
| 44953.520833333336 | 24.42 |
| 44953.53125 | 24.68 |
| 44953.541666666664 | 24.66 |
| 44953.552083333336 | 24.81 |
| 44953.5625 | 25.18 |
| 44953.572916666664 | 26.04 |
| 44953.583333333336 | 26.81 |
| 44953.59375 | 27.51 |
| 44953.604166666664 | 27.91 |
| 44953.614583333336 | 28.18 |
| 44953.625 | 28.45 |
| 44953.635416666664 | 28.66 |
| 44953.645833333336 | 28.89 |
| 44953.65625 | 29.18 |
| 44953.666666666664 | 29.46 |
| 44953.677083333336 | 29.74 |
| 44953.6875 | 29.99 |
| 44953.697916666664 | 30.16 |
| 44953.708333333336 | 30.26 |
| 44953.71875 | 30.35 |
| 44953.729166666664 | 30.41 |
| 44953.739583333336 | 30.44 |
| 44953.75 | 30.46 |
| 44953.760416666664 | 30.54 |
| 44953.770833333336 | 30.48 |
| 44953.78125 | 30.43 |
| 44953.791666666664 | 30.41 |
| 44953.802083333336 | 30.4 |
| 44953.8125 | 30.22 |
| 44953.822916666664 | 29.6 |
| 44953.833333333336 | 29.63 |
| 44953.84375 | 29.28 |
| 44953.854166666664 | 29.26 |
| 44953.864583333336 | 28.57 |
| 44953.875 | 27.99 |
| 44953.885416666664 | 27.22 |
| 44953.895833333336 | 26.72 |
| 44953.90625 | 26.33 |
| 44953.916666666664 | 25.85 |
| 44953.927083333336 | 25.59 |
| 44953.9375 | 25.35 |
| 44953.947916666664 | 25.12 |
| 44953.958333333336 | 24.99 |
| 44953.96875 | 24.92 |
| 44953.979166666664 | 24.89 |
| 44953.989583333336 | 24.84 |
| 44954.0 | 24.68 |
| 44954.010416666664 | 24.58 |
| 44954.020833333336 | 24.61 |
| 44954.03125 | 24.69 |
| 44954.041666666664 | 24.92 |
| 44954.052083333336 | 25.01 |
| 44954.0625 | 25.24 |
| 44954.072916666664 | 26.25 |
| 44954.083333333336 | 26.56 |
| 44954.09375 | 27.04 |
| 44954.104166666664 | 27.75 |
| 44954.114583333336 | 28.4 |
| 44954.125 | 28.54 |
| 44954.135416666664 | 28.81 |
| 44954.145833333336 | 28.99 |
| 44954.15625 | 29.3 |
| 44954.166666666664 | 29.69 |
| 44954.177083333336 | 29.92 |
| 44954.1875 | 30.12 |
| 44954.197916666664 | 30.27 |
| 44954.208333333336 | 30.36 |
| 44954.21875 | 30.43 |
| 44954.229166666664 | 30.49 |
| 44954.239583333336 | 30.49 |
| 44954.25 | 30.51 |
| 44954.260416666664 | 30.53 |
| 44954.270833333336 | 30.54 |
| 44954.28125 | 30.54 |
| 44954.291666666664 | 30.44 |
| 44954.302083333336 | 30.42 |
| 44954.3125 | 30.41 |
| 44954.322916666664 | 30.37 |
| 44954.333333333336 | 30.34 |
| 44954.34375 | 30.31 |
| 44954.354166666664 | 30.26 |
| 44954.364583333336 | 30.21 |
| 44954.375 | 30.14 |
| 44954.385416666664 | 29.84 |
| 44954.395833333336 | 29.53 |
| 44954.40625 | 29.1 |
| 44954.416666666664 | 28.72 |
| 44954.427083333336 | 28.21 |
| 44954.4375 | 27.69 |
| 44954.447916666664 | 27.3 |
| 44954.458333333336 | 27.11 |
| 44954.46875 | 26.8 |
| 44954.479166666664 | 26.55 |
| 44954.489583333336 | 26.36 |
| 44954.5 | 26.16 |
| 44954.510416666664 | 25.97 |
| 44954.520833333336 | 25.82 |
| 44954.53125 | 25.76 |
| 44954.541666666664 | 25.84 |
| 44954.552083333336 | 25.96 |
| 44954.5625 | 26.1 |
| 44954.572916666664 | 26.25 |
| 44954.583333333336 | 26.48 |
| 44954.59375 | 26.83 |
| 44954.604166666664 | 27.51 |
| 44954.614583333336 | 28.02 |
| 44954.625 | 28.42 |
| 44954.635416666664 | 28.75 |
| 44954.645833333336 | 28.91 |
| 44954.65625 | 29.09 |
| 44954.666666666664 | 29.21 |
| 44954.677083333336 | 29.35 |
| 44954.6875 | 29.52 |
| 44954.697916666664 | 29.69 |
| 44954.708333333336 | 29.82 |
| 44954.71875 | 29.94 |
| 44954.729166666664 | 30.04 |
| 44954.739583333336 | 30.14 |
| 44954.75 | 30.25 |
| 44954.760416666664 | 30.32 |
| 44954.770833333336 | 30.39 |
| 44954.78125 | 30.44 |
| 44954.791666666664 | 30.49 |
| 44954.802083333336 | 30.3 |
| 44954.8125 | 30.14 |
| 44954.822916666664 | 30.43 |
| 44954.833333333336 | 30.35 |
| 44954.84375 | 30.19 |
| 44954.854166666664 | 30.02 |
| 44954.864583333336 | 30 |
| 44954.875 | 29.77 |
| 44954.885416666664 | 29.46 |
| 44954.895833333336 | 28.81 |
| 44954.90625 | 28.39 |
| 44954.916666666664 | 27.88 |
| 44954.927083333336 | 27.5 |
| 44954.9375 | 27.24 |
| 44954.947916666664 | 26.98 |
| 44954.958333333336 | 26.71 |
| 44954.96875 | 26.51 |
| 44954.979166666664 | 26.33 |
| 44954.989583333336 | 26.18 |
| 44955.0 | 26.02 |
| 44955.010416666664 | 25.94 |
| 44955.020833333336 | 25.89 |
| 44955.03125 | 25.85 |
| 44955.041666666664 | 25.82 |
| 44955.052083333336 | 25.8 |
| 44955.0625 | 25.84 |
| 44955.072916666664 | 25.93 |
| 44955.083333333336 | 26.05 |
| 44955.09375 | 26.25 |
| 44955.104166666664 | 26.56 |
| 44955.114583333336 | 27.1 |
| 44955.125 | 27.57 |
| 44955.135416666664 | 28.2 |
| 44955.145833333336 | 28.74 |
| 44955.15625 | 28.94 |
| 44955.166666666664 | 29.25 |
| 44955.177083333336 | 29.62 |
| 44955.1875 | 29.88 |
| 44955.197916666664 | 30.05 |
| 44955.208333333336 | 30.15 |
| 44955.21875 | 30.26 |
| 44955.229166666664 | 30.37 |
| 44955.239583333336 | 30.43 |
| 44955.25 | 30.47 |
| 44955.260416666664 | 30.5 |
| 44955.270833333336 | 30.54 |
| 44955.28125 | 30.57 |
| 44955.291666666664 | 30.58 |
| 44955.302083333336 | 30.59 |
| 44955.3125 | 30.59 |
| 44955.322916666664 | 30.53 |
| 44955.333333333336 | 30.52 |
| 44955.34375 | 30.53 |
| 44955.354166666664 | 30.47 |
| 44955.364583333336 | 30.5 |
| 44955.375 | 30.4 |
| 44955.385416666664 | 30.47 |
| 44955.395833333336 | 30.46 |
| 44955.40625 | 30.47 |
| 44955.416666666664 | 30.22 |
| 44955.427083333336 | 30.05 |
| 44955.4375 | 29.85 |
| 44955.447916666664 | 29.56 |
| 44955.458333333336 | 29.3 |
| 44955.46875 | 28.95 |
| 44955.479166666664 | 28.6 |
| 44955.489583333336 | 28.22 |
| 44955.5 | 27.96 |
| 44955.510416666664 | 27.65 |
| 44955.520833333336 | 27.4 |
| 44955.53125 | 27.14 |
| 44955.541666666664 | 26.83 |
| 44955.552083333336 | 26.6 |
| 44955.5625 | 26.56 |
| 44955.572916666664 | 26.5 |
| 44955.583333333336 | 26.74 |
| 44955.59375 | 26.87 |
| 44955.604166666664 | 27.04 |
| 44955.614583333336 | 27.34 |
| 44955.625 | 27.63 |
| 44955.635416666664 | 27.95 |
| 44955.645833333336 | 28.29 |
| 44955.65625 | 28.65 |
| 44955.666666666664 | 29 |
| 44955.677083333336 | 29.28 |
| 44955.6875 | 29.5 |
| 44955.697916666664 | 29.68 |
| 44955.708333333336 | 29.73 |
| 44955.71875 | 29.81 |
| 44955.729166666664 | 29.98 |
| 44955.739583333336 | 30.13 |
| 44955.75 | 30.24 |
| 44955.760416666664 | 30.32 |
| 44955.770833333336 | 30.39 |
| 44955.78125 | 30.43 |
| 44955.791666666664 | 30.46 |
| 44955.802083333336 | 30.51 |
| 44955.8125 | 30.55 |
| 44955.822916666664 | 30.63 |
| 44955.833333333336 | 30.54 |
| 44955.84375 | 30.41 |
| 44955.854166666664 | 30.57 |
| 44955.864583333336 | 30.45 |
| 44955.875 | 30.4 |
| 44955.885416666664 | 30.36 |
| 44955.895833333336 | 30.23 |
| 44955.90625 | 30.21 |
| 44955.916666666664 | 30.24 |
| 44955.927083333336 | 30.16 |
| 44955.9375 | 29.88 |
| 44955.947916666664 | 29.65 |
| 44955.958333333336 | 29.22 |
| 44955.96875 | 29.14 |
| 44955.979166666664 | 28.98 |
| 44955.989583333336 | 28.65 |
| 44956.0 | 28.31 |
| 44956.010416666664 | 27.9 |
| 44956.020833333336 | 27.53 |
| 44956.03125 | 27.2 |
| 44956.041666666664 | 26.99 |
| 44956.052083333336 | 26.88 |
| 44956.0625 | 26.67 |
| 44956.072916666664 | 26.43 |
| 44956.083333333336 | 26.49 |
| 44956.09375 | 26.46 |
| 44956.104166666664 | 26.78 |
| 44956.114583333336 | 27.08 |
| 44956.125 | 27.62 |
| 44956.135416666664 | 27.67 |
| 44956.145833333336 | 28.44 |
| 44956.15625 | 29.11 |
| 44956.166666666664 | 29.48 |
| 44956.177083333336 | 29.67 |
| 44956.1875 | 29.87 |
| 44956.197916666664 | 30.11 |
| 44956.208333333336 | 30.29 |
| 44956.21875 | 30.38 |
| 44956.229166666664 | 30.43 |
| 44956.239583333336 | 30.48 |
| 44956.25 | 30.52 |
| 44956.260416666664 | 30.55 |
| 44956.270833333336 | 30.56 |
| 44956.28125 | 30.59 |
| 44956.291666666664 | 30.63 |
| 44956.302083333336 | 30.68 |
| 44956.3125 | 30.69 |
| 44956.322916666664 | 30.7 |
| 44956.333333333336 | 30.71 |
| 44956.34375 | 30.71 |
| 44956.354166666664 | 30.71 |
| 44956.364583333336 | 30.71 |
| 44956.375 | 30.71 |
| 44956.385416666664 | 30.67 |
| 44956.395833333336 | 30.68 |
| 44956.40625 | 30.67 |
| 44956.416666666664 | 30.6 |
| 44956.427083333336 | 30.54 |
| 44956.4375 | 30.54 |
| 44956.447916666664 | 30.57 |
| 44956.458333333336 | 30.55 |
| 44956.46875 | 30.43 |
| 44956.479166666664 | 30.24 |
| 44956.489583333336 | 29.89 |
| 44956.5 | 29.82 |
| 44956.510416666664 | 29.62 |
| 44956.520833333336 | 29.52 |
| 44956.53125 | 29.36 |
| 44956.541666666664 | 29.06 |
| 44956.552083333336 | 28.67 |
| 44956.5625 | 28.22 |
| 44956.572916666664 | 27.99 |
| 44956.583333333336 | 27.78 |
| 44956.59375 | 27.57 |
| 44956.604166666664 | 27.33 |
| 44956.614583333336 | 27.23 |
| 44956.625 | 26.95 |
| 44956.635416666664 | 26.92 |
| 44956.645833333336 | 27.01 |
| 44956.65625 | 27.24 |
| 44956.666666666664 | 27.52 |
| 44956.677083333336 | 27.75 |
| 44956.6875 | 28.2 |
| 44956.697916666664 | 28.25 |
| 44956.708333333336 | 28.84 |
| 44956.71875 | 29.23 |
| 44956.729166666664 | 29.21 |
| 44956.739583333336 | 29.44 |
| 44956.75 | 29.64 |
| 44956.760416666664 | 29.75 |
| 44956.770833333336 | 29.82 |
| 44956.78125 | 30.03 |
| 44956.791666666664 | 30.13 |
| 44956.802083333336 | 30.18 |
| 44956.8125 | 30.24 |
| 44956.822916666664 | 30.27 |
| 44956.833333333336 | 30.33 |
| 44956.84375 | 30.21 |
| 44956.854166666664 | 30.23 |
| 44956.864583333336 | 30.22 |
| 44956.875 | 30.18 |
| 44956.885416666664 | 30.14 |
| 44956.895833333336 | 30.18 |
| 44956.90625 | 30.13 |
| 44956.916666666664 | 30.12 |
| 44956.927083333336 | 30.12 |
| 44956.9375 | 30.1 |
| 44956.947916666664 | 30.03 |
| 44956.958333333336 | 29.56 |
| 44956.96875 | 29.57 |
| 44956.979166666664 | 29.6 |
| 44956.989583333336 | 29.42 |
| 44957.0 | 29.01 |
| 44957.010416666664 | 28.69 |
| 44957.020833333336 | 28.41 |
| 44957.03125 | 28.11 |
| 44957.041666666664 | 27.95 |
| 44957.052083333336 | 27.56 |
| 44957.0625 | 27.3 |
| 44957.072916666664 | 27.08 |
| 44957.083333333336 | 26.86 |
| 44957.09375 | 26.81 |
| 44957.104166666664 | 26.83 |
| 44957.114583333336 | 26.91 |
| 44957.125 | 27.12 |
| 44957.135416666664 | 27.23 |
| 44957.145833333336 | 27.39 |
| 44957.15625 | 27.68 |
| 44957.166666666664 | 28.05 |
| 44957.177083333336 | 28.49 |
| 44957.1875 | 28.93 |
| 44957.197916666664 | 29.26 |
| 44957.208333333336 | 29.57 |
| 44957.21875 | 29.67 |
| 44957.229166666664 | 29.72 |
| 44957.239583333336 | 29.84 |
| 44957.25 | 29.97 |
| 44957.260416666664 | 30.06 |
| 44957.270833333336 | 30.16 |
| 44957.28125 | 30.24 |
| 44957.291666666664 | 30.33 |
| 44957.302083333336 | 30.41 |
| 44957.3125 | 30.46 |
| 44957.322916666664 | 30.56 |
| 44957.333333333336 | 30.59 |
| 44957.34375 | 30.62 |
| 44957.354166666664 | 30.66 |
| 44957.364583333336 | 30.67 |
| 44957.375 | 30.69 |
| 44957.385416666664 | 30.7 |
| 44957.395833333336 | 30.7 |
| 44957.40625 | 30.7 |
| 44957.416666666664 | 30.69 |
| 44957.427083333336 | 30.6 |
| 44957.4375 | 30.62 |
| 44957.447916666664 | 30.63 |
| 44957.458333333336 | 30.59 |
| 44957.46875 | 30.56 |
| 44957.479166666664 | 30.53 |
| 44957.489583333336 | 30.52 |
| 44957.5 | 30.51 |
| 44957.510416666664 | 30.31 |
| 44957.520833333336 | 30.19 |
| 44957.53125 | 30.01 |
| 44957.541666666664 | 29.85 |
| 44957.552083333336 | 29.66 |
| 44957.5625 | 29.31 |
| 44957.572916666664 | 28.92 |
| 44957.583333333336 | 28.53 |
| 44957.59375 | 28.15 |
| 44957.604166666664 | 27.88 |
| 44957.614583333336 | 27.73 |
| 44957.625 | 27.59 |
| 44957.635416666664 | 27.55 |
| 44957.645833333336 | 27.49 |
| 44957.65625 | 27.45 |
| 44957.666666666664 | 27.41 |
| 44957.677083333336 | 27.34 |
| 44957.6875 | 27.35 |
| 44957.697916666664 | 27.37 |
| 44957.708333333336 | 27.4 |
| 44957.71875 | 27.43 |
| 44957.729166666664 | 27.79 |
| 44957.739583333336 | 27.97 |
| 44957.75 | 28.4 |
| 44957.760416666664 | 28.66 |
| 44957.770833333336 | 28.87 |
| 44957.78125 | 29.05 |
| 44957.791666666664 | 29.55 |
| 44957.802083333336 | 29.82 |
| 44957.8125 | 30.04 |
| 44957.822916666664 | 30.11 |
| 44957.833333333336 | 30.21 |
| 44957.84375 | 30.22 |
| 44957.854166666664 | 30.29 |
| 44957.864583333336 | 30.37 |
| 44957.875 | 30.48 |
| 44957.885416666664 | 30.34 |
| 44957.895833333336 | 30.37 |
| 44957.90625 | 30.35 |
| 44957.916666666664 | 30.33 |
| 44957.927083333336 | 30.37 |
| 44957.9375 | 30.28 |
| 44957.947916666664 | 30.37 |
| 44957.958333333336 | 30.41 |
| 44957.96875 | 30.35 |
| 44957.979166666664 | 30.28 |
| 44957.989583333336 | 29.97 |
| 44958.0 | 29.84 |
| 44958.010416666664 | 29.75 |
| 44958.020833333336 | 29.68 |
| 44958.03125 | 29.68 |
| 44958.041666666664 | 29.83 |
| 44958.052083333336 | 29.53 |
| 44958.0625 | 29.23 |
| 44958.072916666664 | 29.24 |
| 44958.083333333336 | 29.07 |
| 44958.09375 | 28.81 |
| 44958.104166666664 | 28.44 |
| 44958.114583333336 | 28.21 |
| 44958.125 | 28.05 |
| 44958.135416666664 | 27.95 |
| 44958.145833333336 | 27.87 |